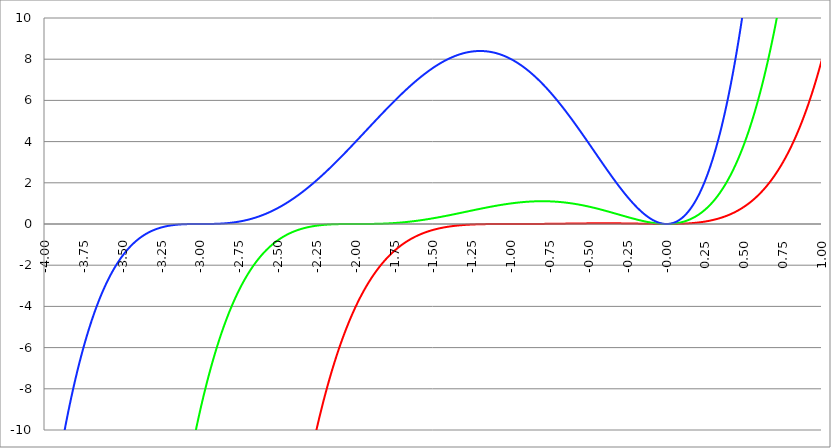
| Category | Series 1 | Series 0 | Series 2 |
|---|---|---|---|
| -4.0 | -432 | -128 | -16 |
| -3.9975 | -430.382 | -127.361 | -15.86 |
| -3.995 | -428.77 | -126.725 | -15.722 |
| -3.9925 | -427.162 | -126.091 | -15.584 |
| -3.99 | -425.559 | -125.46 | -15.447 |
| -3.9875 | -423.96 | -124.831 | -15.311 |
| -3.985 | -422.367 | -124.205 | -15.176 |
| -3.9825 | -420.778 | -123.581 | -15.042 |
| -3.98 | -419.194 | -122.959 | -14.909 |
| -3.9775 | -417.615 | -122.34 | -14.776 |
| -3.975000000000001 | -416.04 | -121.724 | -14.645 |
| -3.972500000000001 | -414.47 | -121.11 | -14.514 |
| -3.970000000000001 | -412.905 | -120.498 | -14.385 |
| -3.967500000000001 | -411.345 | -119.889 | -14.256 |
| -3.965000000000001 | -409.789 | -119.282 | -14.128 |
| -3.962500000000001 | -408.238 | -118.677 | -14 |
| -3.960000000000001 | -406.692 | -118.075 | -13.874 |
| -3.957500000000001 | -405.15 | -117.475 | -13.749 |
| -3.955000000000001 | -403.613 | -116.878 | -13.624 |
| -3.952500000000001 | -402.081 | -116.283 | -13.5 |
| -3.950000000000001 | -400.553 | -115.691 | -13.377 |
| -3.947500000000001 | -399.03 | -115.1 | -13.255 |
| -3.945000000000001 | -397.512 | -114.512 | -13.134 |
| -3.942500000000001 | -395.998 | -113.927 | -13.013 |
| -3.940000000000001 | -394.489 | -113.344 | -12.894 |
| -3.937500000000001 | -392.984 | -112.763 | -12.775 |
| -3.935000000000001 | -391.484 | -112.184 | -12.657 |
| -3.932500000000001 | -389.988 | -111.608 | -12.54 |
| -3.930000000000001 | -388.497 | -111.034 | -12.423 |
| -3.927500000000002 | -387.011 | -110.463 | -12.308 |
| -3.925000000000002 | -385.529 | -109.893 | -12.193 |
| -3.922500000000002 | -384.051 | -109.326 | -12.079 |
| -3.920000000000002 | -382.579 | -108.762 | -11.966 |
| -3.917500000000002 | -381.11 | -108.199 | -11.853 |
| -3.915000000000002 | -379.646 | -107.639 | -11.742 |
| -3.912500000000002 | -378.187 | -107.081 | -11.631 |
| -3.910000000000002 | -376.732 | -106.526 | -11.521 |
| -3.907500000000002 | -375.281 | -105.972 | -11.411 |
| -3.905000000000002 | -373.835 | -105.421 | -11.303 |
| -3.902500000000002 | -372.394 | -104.872 | -11.195 |
| -3.900000000000002 | -370.957 | -104.325 | -11.088 |
| -3.897500000000002 | -369.524 | -103.781 | -10.982 |
| -3.895000000000002 | -368.096 | -103.239 | -10.876 |
| -3.892500000000002 | -366.672 | -102.699 | -10.772 |
| -3.890000000000002 | -365.252 | -102.161 | -10.668 |
| -3.887500000000002 | -363.837 | -101.625 | -10.564 |
| -3.885000000000002 | -362.426 | -101.092 | -10.462 |
| -3.882500000000002 | -361.02 | -100.561 | -10.36 |
| -3.880000000000002 | -359.618 | -100.032 | -10.259 |
| -3.877500000000003 | -358.22 | -99.505 | -10.159 |
| -3.875000000000003 | -356.826 | -98.98 | -10.059 |
| -3.872500000000003 | -355.437 | -98.457 | -9.96 |
| -3.870000000000003 | -354.052 | -97.937 | -9.862 |
| -3.867500000000003 | -352.672 | -97.419 | -9.765 |
| -3.865000000000003 | -351.296 | -96.903 | -9.668 |
| -3.862500000000003 | -349.924 | -96.389 | -9.572 |
| -3.860000000000003 | -348.556 | -95.877 | -9.477 |
| -3.857500000000003 | -347.193 | -95.367 | -9.382 |
| -3.855000000000003 | -345.834 | -94.859 | -9.289 |
| -3.852500000000003 | -344.479 | -94.354 | -9.195 |
| -3.850000000000003 | -343.128 | -93.851 | -9.103 |
| -3.847500000000003 | -341.781 | -93.349 | -9.011 |
| -3.845000000000003 | -340.439 | -92.85 | -8.92 |
| -3.842500000000003 | -339.101 | -92.353 | -8.83 |
| -3.840000000000003 | -337.767 | -91.858 | -8.74 |
| -3.837500000000003 | -336.437 | -91.365 | -8.651 |
| -3.835000000000003 | -335.112 | -90.874 | -8.562 |
| -3.832500000000004 | -333.791 | -90.385 | -8.475 |
| -3.830000000000004 | -332.473 | -89.898 | -8.387 |
| -3.827500000000004 | -331.16 | -89.413 | -8.301 |
| -3.825000000000004 | -329.851 | -88.931 | -8.215 |
| -3.822500000000004 | -328.546 | -88.45 | -8.13 |
| -3.820000000000004 | -327.246 | -87.971 | -8.046 |
| -3.817500000000004 | -325.949 | -87.495 | -7.962 |
| -3.815000000000004 | -324.657 | -87.02 | -7.879 |
| -3.812500000000004 | -323.368 | -86.547 | -7.796 |
| -3.810000000000004 | -322.084 | -86.077 | -7.714 |
| -3.807500000000004 | -320.804 | -85.608 | -7.633 |
| -3.805000000000004 | -319.527 | -85.141 | -7.553 |
| -3.802500000000004 | -318.255 | -84.677 | -7.473 |
| -3.800000000000004 | -316.987 | -84.214 | -7.393 |
| -3.797500000000004 | -315.723 | -83.753 | -7.315 |
| -3.795000000000004 | -314.463 | -83.295 | -7.236 |
| -3.792500000000004 | -313.206 | -82.838 | -7.159 |
| -3.790000000000004 | -311.954 | -82.383 | -7.082 |
| -3.787500000000004 | -310.706 | -81.93 | -7.006 |
| -3.785000000000004 | -309.462 | -81.479 | -6.93 |
| -3.782500000000005 | -308.222 | -81.03 | -6.855 |
| -3.780000000000005 | -306.986 | -80.583 | -6.781 |
| -3.777500000000005 | -305.753 | -80.138 | -6.707 |
| -3.775000000000005 | -304.525 | -79.695 | -6.633 |
| -3.772500000000005 | -303.301 | -79.253 | -6.561 |
| -3.770000000000005 | -302.08 | -78.814 | -6.489 |
| -3.767500000000005 | -300.863 | -78.376 | -6.417 |
| -3.765000000000005 | -299.651 | -77.941 | -6.346 |
| -3.762500000000005 | -298.442 | -77.507 | -6.276 |
| -3.760000000000005 | -297.237 | -77.075 | -6.206 |
| -3.757500000000005 | -296.036 | -76.645 | -6.137 |
| -3.755000000000005 | -294.839 | -76.217 | -6.068 |
| -3.752500000000005 | -293.646 | -75.791 | -6 |
| -3.750000000000005 | -292.456 | -75.366 | -5.933 |
| -3.747500000000005 | -291.27 | -74.944 | -5.866 |
| -3.745000000000005 | -290.089 | -74.523 | -5.799 |
| -3.742500000000005 | -288.911 | -74.104 | -5.733 |
| -3.740000000000005 | -287.736 | -73.687 | -5.668 |
| -3.737500000000006 | -286.566 | -73.272 | -5.603 |
| -3.735000000000006 | -285.399 | -72.858 | -5.539 |
| -3.732500000000006 | -284.237 | -72.447 | -5.475 |
| -3.730000000000006 | -283.078 | -72.037 | -5.412 |
| -3.727500000000006 | -281.922 | -71.629 | -5.35 |
| -3.725000000000006 | -280.771 | -71.223 | -5.288 |
| -3.722500000000006 | -279.623 | -70.819 | -5.226 |
| -3.720000000000006 | -278.479 | -70.416 | -5.165 |
| -3.717500000000006 | -277.339 | -70.015 | -5.105 |
| -3.715000000000006 | -276.202 | -69.616 | -5.045 |
| -3.712500000000006 | -275.069 | -69.219 | -4.985 |
| -3.710000000000006 | -273.94 | -68.823 | -4.926 |
| -3.707500000000006 | -272.815 | -68.43 | -4.868 |
| -3.705000000000006 | -271.693 | -68.038 | -4.81 |
| -3.702500000000006 | -270.575 | -67.647 | -4.753 |
| -3.700000000000006 | -269.46 | -67.259 | -4.696 |
| -3.697500000000006 | -268.349 | -66.872 | -4.639 |
| -3.695000000000006 | -267.242 | -66.487 | -4.583 |
| -3.692500000000006 | -266.139 | -66.104 | -4.528 |
| -3.690000000000006 | -265.039 | -65.722 | -4.473 |
| -3.687500000000006 | -263.943 | -65.342 | -4.419 |
| -3.685000000000007 | -262.85 | -64.964 | -4.365 |
| -3.682500000000007 | -261.761 | -64.588 | -4.311 |
| -3.680000000000007 | -260.675 | -64.213 | -4.258 |
| -3.677500000000007 | -259.593 | -63.84 | -4.206 |
| -3.675000000000007 | -258.515 | -63.469 | -4.154 |
| -3.672500000000007 | -257.44 | -63.099 | -4.102 |
| -3.670000000000007 | -256.369 | -62.731 | -4.051 |
| -3.667500000000007 | -255.302 | -62.365 | -4 |
| -3.665000000000007 | -254.237 | -62 | -3.95 |
| -3.662500000000007 | -253.177 | -61.637 | -3.9 |
| -3.660000000000007 | -252.12 | -61.275 | -3.851 |
| -3.657500000000007 | -251.066 | -60.916 | -3.802 |
| -3.655000000000007 | -250.016 | -60.558 | -3.754 |
| -3.652500000000007 | -248.97 | -60.201 | -3.706 |
| -3.650000000000007 | -247.927 | -59.846 | -3.659 |
| -3.647500000000007 | -246.887 | -59.493 | -3.612 |
| -3.645000000000007 | -245.851 | -59.142 | -3.565 |
| -3.642500000000008 | -244.818 | -58.792 | -3.519 |
| -3.640000000000008 | -243.789 | -58.443 | -3.473 |
| -3.637500000000008 | -242.764 | -58.096 | -3.428 |
| -3.635000000000008 | -241.741 | -57.751 | -3.383 |
| -3.632500000000008 | -240.722 | -57.408 | -3.339 |
| -3.630000000000008 | -239.707 | -57.066 | -3.295 |
| -3.627500000000008 | -238.695 | -56.725 | -3.251 |
| -3.625000000000008 | -237.686 | -56.387 | -3.208 |
| -3.622500000000008 | -236.681 | -56.049 | -3.165 |
| -3.620000000000008 | -235.679 | -55.714 | -3.123 |
| -3.617500000000008 | -234.681 | -55.38 | -3.081 |
| -3.615000000000008 | -233.685 | -55.047 | -3.04 |
| -3.612500000000008 | -232.694 | -54.716 | -2.999 |
| -3.610000000000008 | -231.705 | -54.387 | -2.958 |
| -3.607500000000008 | -230.72 | -54.059 | -2.918 |
| -3.605000000000008 | -229.738 | -53.732 | -2.878 |
| -3.602500000000008 | -228.76 | -53.407 | -2.838 |
| -3.600000000000008 | -227.785 | -53.084 | -2.799 |
| -3.597500000000009 | -226.813 | -52.762 | -2.761 |
| -3.595000000000009 | -225.845 | -52.442 | -2.722 |
| -3.592500000000009 | -224.879 | -52.123 | -2.684 |
| -3.590000000000009 | -223.918 | -51.806 | -2.647 |
| -3.587500000000009 | -222.959 | -51.49 | -2.61 |
| -3.585000000000009 | -222.004 | -51.176 | -2.573 |
| -3.582500000000009 | -221.051 | -50.863 | -2.537 |
| -3.580000000000009 | -220.103 | -50.552 | -2.501 |
| -3.577500000000009 | -219.157 | -50.242 | -2.465 |
| -3.575000000000009 | -218.215 | -49.934 | -2.43 |
| -3.572500000000009 | -217.275 | -49.627 | -2.395 |
| -3.570000000000009 | -216.339 | -49.321 | -2.36 |
| -3.56750000000001 | -215.407 | -49.017 | -2.326 |
| -3.565000000000009 | -214.477 | -48.715 | -2.292 |
| -3.562500000000009 | -213.551 | -48.414 | -2.259 |
| -3.560000000000009 | -212.628 | -48.114 | -2.226 |
| -3.557500000000009 | -211.708 | -47.816 | -2.193 |
| -3.555000000000009 | -210.791 | -47.519 | -2.161 |
| -3.55250000000001 | -209.877 | -47.224 | -2.128 |
| -3.55000000000001 | -208.967 | -46.93 | -2.097 |
| -3.54750000000001 | -208.059 | -46.638 | -2.065 |
| -3.54500000000001 | -207.155 | -46.347 | -2.034 |
| -3.54250000000001 | -206.254 | -46.057 | -2.004 |
| -3.54000000000001 | -205.356 | -45.769 | -1.973 |
| -3.53750000000001 | -204.461 | -45.482 | -1.943 |
| -3.53500000000001 | -203.57 | -45.196 | -1.914 |
| -3.53250000000001 | -202.681 | -44.912 | -1.884 |
| -3.53000000000001 | -201.795 | -44.63 | -1.855 |
| -3.52750000000001 | -200.913 | -44.348 | -1.826 |
| -3.52500000000001 | -200.033 | -44.068 | -1.798 |
| -3.52250000000001 | -199.157 | -43.79 | -1.77 |
| -3.52000000000001 | -198.284 | -43.513 | -1.742 |
| -3.51750000000001 | -197.413 | -43.237 | -1.715 |
| -3.51500000000001 | -196.546 | -42.962 | -1.688 |
| -3.51250000000001 | -195.682 | -42.689 | -1.661 |
| -3.51000000000001 | -194.821 | -42.418 | -1.634 |
| -3.50750000000001 | -193.963 | -42.147 | -1.608 |
| -3.505000000000011 | -193.108 | -41.878 | -1.582 |
| -3.502500000000011 | -192.255 | -41.61 | -1.557 |
| -3.500000000000011 | -191.406 | -41.344 | -1.531 |
| -3.497500000000011 | -190.56 | -41.079 | -1.506 |
| -3.495000000000011 | -189.717 | -40.815 | -1.482 |
| -3.492500000000011 | -188.877 | -40.552 | -1.457 |
| -3.490000000000011 | -188.039 | -40.291 | -1.433 |
| -3.487500000000011 | -187.205 | -40.031 | -1.409 |
| -3.485000000000011 | -186.374 | -39.773 | -1.386 |
| -3.482500000000011 | -185.545 | -39.515 | -1.362 |
| -3.480000000000011 | -184.72 | -39.259 | -1.339 |
| -3.477500000000011 | -183.897 | -39.005 | -1.317 |
| -3.475000000000011 | -183.078 | -38.751 | -1.294 |
| -3.472500000000011 | -182.261 | -38.499 | -1.272 |
| -3.470000000000011 | -181.447 | -38.248 | -1.25 |
| -3.467500000000011 | -180.636 | -37.999 | -1.229 |
| -3.465000000000011 | -179.828 | -37.75 | -1.207 |
| -3.462500000000011 | -179.023 | -37.503 | -1.186 |
| -3.460000000000011 | -178.22 | -37.257 | -1.165 |
| -3.457500000000012 | -177.421 | -37.013 | -1.145 |
| -3.455000000000012 | -176.624 | -36.769 | -1.124 |
| -3.452500000000012 | -175.831 | -36.527 | -1.104 |
| -3.450000000000012 | -175.04 | -36.286 | -1.085 |
| -3.447500000000012 | -174.252 | -36.047 | -1.065 |
| -3.445000000000012 | -173.466 | -35.808 | -1.046 |
| -3.442500000000012 | -172.684 | -35.571 | -1.027 |
| -3.440000000000012 | -171.904 | -35.335 | -1.008 |
| -3.437500000000012 | -171.127 | -35.1 | -0.99 |
| -3.435000000000012 | -170.353 | -34.867 | -0.971 |
| -3.432500000000012 | -169.582 | -34.634 | -0.953 |
| -3.430000000000012 | -168.813 | -34.403 | -0.935 |
| -3.427500000000012 | -168.048 | -34.173 | -0.918 |
| -3.425000000000012 | -167.285 | -33.944 | -0.901 |
| -3.422500000000012 | -166.525 | -33.717 | -0.883 |
| -3.420000000000012 | -165.767 | -33.49 | -0.867 |
| -3.417500000000012 | -165.012 | -33.265 | -0.85 |
| -3.415000000000012 | -164.26 | -33.041 | -0.834 |
| -3.412500000000012 | -163.511 | -32.818 | -0.817 |
| -3.410000000000013 | -162.765 | -32.596 | -0.801 |
| -3.407500000000012 | -162.021 | -32.376 | -0.786 |
| -3.405000000000013 | -161.28 | -32.156 | -0.77 |
| -3.402500000000013 | -160.541 | -31.938 | -0.755 |
| -3.400000000000013 | -159.805 | -31.721 | -0.74 |
| -3.397500000000013 | -159.072 | -31.505 | -0.725 |
| -3.395000000000013 | -158.342 | -31.29 | -0.71 |
| -3.392500000000013 | -157.614 | -31.076 | -0.696 |
| -3.390000000000013 | -156.889 | -30.863 | -0.682 |
| -3.387500000000013 | -156.167 | -30.652 | -0.668 |
| -3.385000000000013 | -155.447 | -30.442 | -0.654 |
| -3.382500000000013 | -154.73 | -30.232 | -0.64 |
| -3.380000000000013 | -154.015 | -30.024 | -0.627 |
| -3.377500000000013 | -153.304 | -29.817 | -0.614 |
| -3.375000000000013 | -152.594 | -29.611 | -0.601 |
| -3.372500000000013 | -151.888 | -29.406 | -0.588 |
| -3.370000000000013 | -151.184 | -29.203 | -0.575 |
| -3.367500000000013 | -150.482 | -29 | -0.563 |
| -3.365000000000013 | -149.783 | -28.798 | -0.551 |
| -3.362500000000014 | -149.087 | -28.598 | -0.539 |
| -3.360000000000014 | -148.393 | -28.398 | -0.527 |
| -3.357500000000014 | -147.702 | -28.2 | -0.515 |
| -3.355000000000014 | -147.014 | -28.003 | -0.504 |
| -3.352500000000014 | -146.328 | -27.807 | -0.492 |
| -3.350000000000014 | -145.644 | -27.612 | -0.481 |
| -3.347500000000014 | -144.963 | -27.417 | -0.47 |
| -3.345000000000014 | -144.285 | -27.224 | -0.459 |
| -3.342500000000014 | -143.609 | -27.032 | -0.449 |
| -3.340000000000014 | -142.936 | -26.842 | -0.438 |
| -3.337500000000014 | -142.265 | -26.652 | -0.428 |
| -3.335000000000014 | -141.596 | -26.463 | -0.418 |
| -3.332500000000014 | -140.931 | -26.275 | -0.408 |
| -3.330000000000014 | -140.267 | -26.088 | -0.399 |
| -3.327500000000014 | -139.606 | -25.902 | -0.389 |
| -3.325000000000014 | -138.948 | -25.718 | -0.38 |
| -3.322500000000014 | -138.292 | -25.534 | -0.37 |
| -3.320000000000014 | -137.639 | -25.351 | -0.361 |
| -3.317500000000015 | -136.988 | -25.169 | -0.352 |
| -3.315000000000015 | -136.339 | -24.989 | -0.343 |
| -3.312500000000015 | -135.693 | -24.809 | -0.335 |
| -3.310000000000015 | -135.049 | -24.63 | -0.326 |
| -3.307500000000015 | -134.408 | -24.453 | -0.318 |
| -3.305000000000015 | -133.769 | -24.276 | -0.31 |
| -3.302500000000015 | -133.133 | -24.1 | -0.302 |
| -3.300000000000015 | -132.499 | -23.925 | -0.294 |
| -3.297500000000015 | -131.867 | -23.752 | -0.286 |
| -3.295000000000015 | -131.238 | -23.579 | -0.279 |
| -3.292500000000015 | -130.611 | -23.407 | -0.271 |
| -3.290000000000015 | -129.986 | -23.236 | -0.264 |
| -3.287500000000015 | -129.364 | -23.066 | -0.257 |
| -3.285000000000015 | -128.745 | -22.897 | -0.25 |
| -3.282500000000015 | -128.127 | -22.729 | -0.243 |
| -3.280000000000015 | -127.512 | -22.562 | -0.236 |
| -3.277500000000015 | -126.9 | -22.396 | -0.23 |
| -3.275000000000015 | -126.289 | -22.231 | -0.223 |
| -3.272500000000015 | -125.681 | -22.066 | -0.217 |
| -3.270000000000016 | -125.076 | -21.903 | -0.21 |
| -3.267500000000015 | -124.472 | -21.741 | -0.204 |
| -3.265000000000016 | -123.871 | -21.579 | -0.198 |
| -3.262500000000016 | -123.273 | -21.419 | -0.193 |
| -3.260000000000016 | -122.676 | -21.259 | -0.187 |
| -3.257500000000016 | -122.082 | -21.101 | -0.181 |
| -3.255000000000016 | -121.49 | -20.943 | -0.176 |
| -3.252500000000016 | -120.901 | -20.786 | -0.17 |
| -3.250000000000016 | -120.313 | -20.63 | -0.165 |
| -3.247500000000016 | -119.728 | -20.475 | -0.16 |
| -3.245000000000016 | -119.146 | -20.321 | -0.155 |
| -3.242500000000016 | -118.565 | -20.167 | -0.15 |
| -3.240000000000016 | -117.987 | -20.015 | -0.145 |
| -3.237500000000016 | -117.411 | -19.863 | -0.14 |
| -3.235000000000016 | -116.837 | -19.713 | -0.136 |
| -3.232500000000016 | -116.266 | -19.563 | -0.131 |
| -3.230000000000016 | -115.696 | -19.414 | -0.127 |
| -3.227500000000016 | -115.129 | -19.266 | -0.123 |
| -3.225000000000016 | -114.564 | -19.119 | -0.118 |
| -3.222500000000016 | -114.002 | -18.973 | -0.114 |
| -3.220000000000016 | -113.441 | -18.827 | -0.11 |
| -3.217500000000016 | -112.883 | -18.683 | -0.107 |
| -3.215000000000017 | -112.327 | -18.539 | -0.103 |
| -3.212500000000017 | -111.773 | -18.396 | -0.099 |
| -3.210000000000017 | -111.221 | -18.254 | -0.095 |
| -3.207500000000016 | -110.671 | -18.113 | -0.092 |
| -3.205000000000017 | -110.124 | -17.973 | -0.088 |
| -3.202500000000017 | -109.579 | -17.833 | -0.085 |
| -3.200000000000017 | -109.036 | -17.695 | -0.082 |
| -3.197500000000017 | -108.495 | -17.557 | -0.079 |
| -3.195000000000017 | -107.956 | -17.42 | -0.076 |
| -3.192500000000017 | -107.419 | -17.284 | -0.073 |
| -3.190000000000017 | -106.884 | -17.148 | -0.07 |
| -3.187500000000017 | -106.352 | -17.014 | -0.067 |
| -3.185000000000017 | -105.821 | -16.88 | -0.064 |
| -3.182500000000017 | -105.293 | -16.747 | -0.062 |
| -3.180000000000017 | -104.767 | -16.615 | -0.059 |
| -3.177500000000017 | -104.243 | -16.484 | -0.056 |
| -3.175000000000018 | -103.721 | -16.353 | -0.054 |
| -3.172500000000018 | -103.201 | -16.223 | -0.052 |
| -3.170000000000018 | -102.683 | -16.094 | -0.049 |
| -3.167500000000017 | -102.167 | -15.966 | -0.047 |
| -3.165000000000018 | -101.653 | -15.839 | -0.045 |
| -3.162500000000018 | -101.142 | -15.712 | -0.043 |
| -3.160000000000018 | -100.632 | -15.586 | -0.041 |
| -3.157500000000018 | -100.124 | -15.461 | -0.039 |
| -3.155000000000018 | -99.619 | -15.337 | -0.037 |
| -3.152500000000018 | -99.115 | -15.214 | -0.035 |
| -3.150000000000018 | -98.614 | -15.091 | -0.033 |
| -3.147500000000018 | -98.114 | -14.969 | -0.032 |
| -3.145000000000018 | -97.616 | -14.848 | -0.03 |
| -3.142500000000018 | -97.121 | -14.727 | -0.029 |
| -3.140000000000018 | -96.627 | -14.607 | -0.027 |
| -3.137500000000018 | -96.136 | -14.488 | -0.026 |
| -3.135000000000018 | -95.646 | -14.37 | -0.024 |
| -3.132500000000018 | -95.159 | -14.253 | -0.023 |
| -3.130000000000019 | -94.673 | -14.136 | -0.022 |
| -3.127500000000018 | -94.19 | -14.02 | -0.02 |
| -3.125000000000019 | -93.708 | -13.905 | -0.019 |
| -3.122500000000019 | -93.228 | -13.79 | -0.018 |
| -3.120000000000019 | -92.751 | -13.676 | -0.017 |
| -3.117500000000019 | -92.275 | -13.563 | -0.016 |
| -3.115000000000019 | -91.801 | -13.451 | -0.015 |
| -3.112500000000019 | -91.329 | -13.339 | -0.014 |
| -3.110000000000019 | -90.859 | -13.228 | -0.013 |
| -3.10750000000002 | -90.391 | -13.118 | -0.012 |
| -3.10500000000002 | -89.925 | -13.008 | -0.011 |
| -3.10250000000002 | -89.461 | -12.899 | -0.01 |
| -3.10000000000002 | -88.998 | -12.791 | -0.01 |
| -3.09750000000002 | -88.538 | -12.683 | -0.009 |
| -3.095000000000019 | -88.079 | -12.577 | -0.008 |
| -3.092500000000019 | -87.623 | -12.47 | -0.008 |
| -3.090000000000019 | -87.168 | -12.365 | -0.007 |
| -3.08750000000002 | -86.715 | -12.26 | -0.006 |
| -3.085000000000019 | -86.264 | -12.156 | -0.006 |
| -3.08250000000002 | -85.815 | -12.053 | -0.005 |
| -3.08000000000002 | -85.367 | -11.95 | -0.005 |
| -3.07750000000002 | -84.922 | -11.848 | -0.004 |
| -3.07500000000002 | -84.478 | -11.747 | -0.004 |
| -3.07250000000002 | -84.036 | -11.646 | -0.004 |
| -3.07000000000002 | -83.596 | -11.546 | -0.003 |
| -3.06750000000002 | -83.158 | -11.447 | -0.003 |
| -3.06500000000002 | -82.722 | -11.348 | -0.003 |
| -3.06250000000002 | -82.288 | -11.25 | -0.002 |
| -3.06000000000002 | -81.855 | -11.152 | -0.002 |
| -3.05750000000002 | -81.424 | -11.055 | -0.002 |
| -3.05500000000002 | -80.995 | -10.959 | -0.002 |
| -3.05250000000002 | -80.568 | -10.864 | -0.001 |
| -3.05000000000002 | -80.142 | -10.769 | -0.001 |
| -3.04750000000002 | -79.719 | -10.675 | -0.001 |
| -3.04500000000002 | -79.297 | -10.581 | -0.001 |
| -3.04250000000002 | -78.876 | -10.488 | -0.001 |
| -3.04000000000002 | -78.458 | -10.396 | -0.001 |
| -3.037500000000021 | -78.041 | -10.304 | 0 |
| -3.035000000000021 | -77.627 | -10.213 | 0 |
| -3.032500000000021 | -77.214 | -10.122 | 0 |
| -3.030000000000021 | -76.802 | -10.032 | 0 |
| -3.027500000000021 | -76.393 | -9.943 | 0 |
| -3.025000000000021 | -75.985 | -9.854 | 0 |
| -3.022500000000021 | -75.578 | -9.766 | 0 |
| -3.020000000000021 | -75.174 | -9.679 | 0 |
| -3.017500000000021 | -74.771 | -9.592 | 0 |
| -3.015000000000021 | -74.37 | -9.505 | 0 |
| -3.012500000000021 | -73.971 | -9.42 | 0 |
| -3.010000000000021 | -73.573 | -9.335 | 0 |
| -3.007500000000021 | -73.178 | -9.25 | 0 |
| -3.005000000000021 | -72.783 | -9.166 | 0 |
| -3.002500000000021 | -72.391 | -9.083 | 0 |
| -3.000000000000021 | -72 | -9 | 0 |
| -2.997500000000021 | -71.611 | -8.918 | 0 |
| -2.995000000000021 | -71.223 | -8.836 | 0 |
| -2.992500000000021 | -70.838 | -8.755 | 0 |
| -2.990000000000021 | -70.453 | -8.675 | 0 |
| -2.987500000000022 | -70.071 | -8.595 | 0 |
| -2.985000000000022 | -69.69 | -8.515 | 0 |
| -2.982500000000022 | -69.311 | -8.436 | 0 |
| -2.980000000000022 | -68.933 | -8.358 | 0 |
| -2.977500000000022 | -68.557 | -8.28 | 0 |
| -2.975000000000022 | -68.183 | -8.203 | 0 |
| -2.972500000000022 | -67.81 | -8.127 | 0 |
| -2.970000000000022 | -67.439 | -8.051 | 0 |
| -2.967500000000022 | -67.07 | -7.975 | 0 |
| -2.965000000000022 | -66.702 | -7.9 | 0 |
| -2.962500000000022 | -66.335 | -7.826 | 0 |
| -2.960000000000022 | -65.971 | -7.752 | 0.001 |
| -2.957500000000022 | -65.608 | -7.678 | 0.001 |
| -2.955000000000022 | -65.246 | -7.605 | 0.001 |
| -2.952500000000022 | -64.886 | -7.533 | 0.001 |
| -2.950000000000022 | -64.528 | -7.461 | 0.001 |
| -2.947500000000022 | -64.171 | -7.39 | 0.001 |
| -2.945000000000022 | -63.816 | -7.319 | 0.001 |
| -2.942500000000023 | -63.462 | -7.249 | 0.002 |
| -2.940000000000023 | -63.11 | -7.179 | 0.002 |
| -2.937500000000023 | -62.76 | -7.11 | 0.002 |
| -2.935000000000023 | -62.411 | -7.041 | 0.002 |
| -2.932500000000023 | -62.063 | -6.973 | 0.003 |
| -2.930000000000023 | -61.717 | -6.905 | 0.003 |
| -2.927500000000023 | -61.373 | -6.838 | 0.003 |
| -2.925000000000023 | -61.03 | -6.771 | 0.004 |
| -2.922500000000023 | -60.689 | -6.705 | 0.004 |
| -2.920000000000023 | -60.349 | -6.639 | 0.004 |
| -2.917500000000023 | -60.011 | -6.574 | 0.005 |
| -2.915000000000023 | -59.674 | -6.509 | 0.005 |
| -2.912500000000023 | -59.338 | -6.445 | 0.006 |
| -2.910000000000023 | -59.005 | -6.381 | 0.006 |
| -2.907500000000023 | -58.672 | -6.318 | 0.007 |
| -2.905000000000023 | -58.341 | -6.255 | 0.007 |
| -2.902500000000023 | -58.012 | -6.193 | 0.008 |
| -2.900000000000023 | -57.684 | -6.131 | 0.008 |
| -2.897500000000023 | -57.358 | -6.069 | 0.009 |
| -2.895000000000023 | -57.033 | -6.009 | 0.01 |
| -2.892500000000024 | -56.709 | -5.948 | 0.01 |
| -2.890000000000024 | -56.387 | -5.888 | 0.011 |
| -2.887500000000024 | -56.067 | -5.828 | 0.012 |
| -2.885000000000024 | -55.748 | -5.769 | 0.013 |
| -2.882500000000024 | -55.43 | -5.711 | 0.013 |
| -2.880000000000024 | -55.114 | -5.652 | 0.014 |
| -2.877500000000024 | -54.799 | -5.595 | 0.015 |
| -2.875000000000024 | -54.485 | -5.537 | 0.016 |
| -2.872500000000024 | -54.173 | -5.48 | 0.017 |
| -2.870000000000024 | -53.863 | -5.424 | 0.018 |
| -2.867500000000024 | -53.554 | -5.368 | 0.019 |
| -2.865000000000024 | -53.246 | -5.312 | 0.02 |
| -2.862500000000024 | -52.939 | -5.257 | 0.021 |
| -2.860000000000024 | -52.635 | -5.203 | 0.022 |
| -2.857500000000024 | -52.331 | -5.148 | 0.024 |
| -2.855000000000024 | -52.029 | -5.095 | 0.025 |
| -2.852500000000024 | -51.728 | -5.041 | 0.026 |
| -2.850000000000024 | -51.429 | -4.988 | 0.027 |
| -2.847500000000025 | -51.131 | -4.936 | 0.029 |
| -2.845000000000025 | -50.834 | -4.884 | 0.03 |
| -2.842500000000025 | -50.539 | -4.832 | 0.032 |
| -2.840000000000025 | -50.245 | -4.781 | 0.033 |
| -2.837500000000025 | -49.952 | -4.73 | 0.035 |
| -2.835000000000025 | -49.661 | -4.679 | 0.036 |
| -2.832500000000025 | -49.371 | -4.629 | 0.038 |
| -2.830000000000025 | -49.082 | -4.579 | 0.039 |
| -2.827500000000025 | -48.795 | -4.53 | 0.041 |
| -2.825000000000025 | -48.509 | -4.481 | 0.043 |
| -2.822500000000025 | -48.225 | -4.433 | 0.045 |
| -2.820000000000025 | -47.942 | -4.385 | 0.046 |
| -2.817500000000025 | -47.66 | -4.337 | 0.048 |
| -2.815000000000025 | -47.379 | -4.29 | 0.05 |
| -2.812500000000025 | -47.1 | -4.243 | 0.052 |
| -2.810000000000025 | -46.822 | -4.196 | 0.054 |
| -2.807500000000025 | -46.545 | -4.15 | 0.056 |
| -2.805000000000025 | -46.27 | -4.104 | 0.058 |
| -2.802500000000025 | -45.996 | -4.059 | 0.061 |
| -2.800000000000026 | -45.723 | -4.014 | 0.063 |
| -2.797500000000026 | -45.451 | -3.969 | 0.065 |
| -2.795000000000026 | -45.181 | -3.925 | 0.067 |
| -2.792500000000026 | -44.912 | -3.881 | 0.07 |
| -2.790000000000026 | -44.644 | -3.838 | 0.072 |
| -2.787500000000026 | -44.378 | -3.795 | 0.075 |
| -2.785000000000026 | -44.113 | -3.752 | 0.077 |
| -2.782500000000026 | -43.849 | -3.71 | 0.08 |
| -2.780000000000026 | -43.586 | -3.668 | 0.082 |
| -2.777500000000026 | -43.325 | -3.626 | 0.085 |
| -2.775000000000026 | -43.065 | -3.585 | 0.088 |
| -2.772500000000026 | -42.806 | -3.544 | 0.091 |
| -2.770000000000026 | -42.548 | -3.503 | 0.093 |
| -2.767500000000026 | -42.292 | -3.463 | 0.096 |
| -2.765000000000026 | -42.036 | -3.423 | 0.099 |
| -2.762500000000026 | -41.782 | -3.383 | 0.102 |
| -2.760000000000026 | -41.529 | -3.344 | 0.105 |
| -2.757500000000026 | -41.278 | -3.305 | 0.108 |
| -2.755000000000026 | -41.027 | -3.267 | 0.112 |
| -2.752500000000027 | -40.778 | -3.228 | 0.115 |
| -2.750000000000027 | -40.53 | -3.19 | 0.118 |
| -2.747500000000026 | -40.283 | -3.153 | 0.122 |
| -2.745000000000027 | -40.038 | -3.116 | 0.125 |
| -2.742500000000027 | -39.793 | -3.079 | 0.128 |
| -2.740000000000027 | -39.55 | -3.042 | 0.132 |
| -2.737500000000027 | -39.308 | -3.006 | 0.136 |
| -2.735000000000027 | -39.067 | -2.97 | 0.139 |
| -2.732500000000027 | -38.828 | -2.935 | 0.143 |
| -2.730000000000027 | -38.589 | -2.899 | 0.147 |
| -2.727500000000027 | -38.352 | -2.864 | 0.151 |
| -2.725000000000027 | -38.115 | -2.83 | 0.154 |
| -2.722500000000027 | -37.88 | -2.795 | 0.158 |
| -2.720000000000027 | -37.646 | -2.761 | 0.162 |
| -2.717500000000027 | -37.414 | -2.728 | 0.166 |
| -2.715000000000027 | -37.182 | -2.694 | 0.171 |
| -2.712500000000027 | -36.951 | -2.661 | 0.175 |
| -2.710000000000027 | -36.722 | -2.629 | 0.179 |
| -2.707500000000027 | -36.494 | -2.596 | 0.183 |
| -2.705000000000028 | -36.267 | -2.564 | 0.188 |
| -2.702500000000028 | -36.041 | -2.532 | 0.192 |
| -2.700000000000028 | -35.816 | -2.5 | 0.197 |
| -2.697500000000028 | -35.592 | -2.469 | 0.201 |
| -2.695000000000028 | -35.369 | -2.438 | 0.206 |
| -2.692500000000028 | -35.148 | -2.408 | 0.211 |
| -2.690000000000028 | -34.927 | -2.377 | 0.216 |
| -2.687500000000028 | -34.708 | -2.347 | 0.22 |
| -2.685000000000028 | -34.49 | -2.317 | 0.225 |
| -2.682500000000028 | -34.272 | -2.288 | 0.23 |
| -2.680000000000028 | -34.056 | -2.258 | 0.235 |
| -2.677500000000028 | -33.841 | -2.229 | 0.24 |
| -2.675000000000028 | -33.627 | -2.201 | 0.246 |
| -2.672500000000028 | -33.414 | -2.172 | 0.251 |
| -2.670000000000028 | -33.203 | -2.144 | 0.256 |
| -2.667500000000028 | -32.992 | -2.116 | 0.262 |
| -2.665000000000028 | -32.782 | -2.089 | 0.267 |
| -2.662500000000028 | -32.573 | -2.061 | 0.273 |
| -2.660000000000028 | -32.366 | -2.034 | 0.278 |
| -2.657500000000029 | -32.159 | -2.007 | 0.284 |
| -2.655000000000029 | -31.954 | -1.981 | 0.289 |
| -2.652500000000029 | -31.749 | -1.955 | 0.295 |
| -2.650000000000029 | -31.546 | -1.929 | 0.301 |
| -2.647500000000029 | -31.344 | -1.903 | 0.307 |
| -2.645000000000029 | -31.142 | -1.877 | 0.313 |
| -2.642500000000029 | -30.942 | -1.852 | 0.319 |
| -2.640000000000029 | -30.743 | -1.827 | 0.325 |
| -2.637500000000029 | -30.544 | -1.802 | 0.331 |
| -2.635000000000029 | -30.347 | -1.778 | 0.338 |
| -2.632500000000029 | -30.151 | -1.754 | 0.344 |
| -2.630000000000029 | -29.955 | -1.73 | 0.35 |
| -2.62750000000003 | -29.761 | -1.706 | 0.357 |
| -2.625000000000029 | -29.568 | -1.682 | 0.363 |
| -2.622500000000029 | -29.375 | -1.659 | 0.37 |
| -2.620000000000029 | -29.184 | -1.636 | 0.377 |
| -2.617500000000029 | -28.994 | -1.613 | 0.383 |
| -2.615000000000029 | -28.805 | -1.591 | 0.39 |
| -2.612500000000029 | -28.616 | -1.568 | 0.397 |
| -2.61000000000003 | -28.429 | -1.546 | 0.404 |
| -2.60750000000003 | -28.242 | -1.524 | 0.411 |
| -2.60500000000003 | -28.057 | -1.503 | 0.418 |
| -2.60250000000003 | -27.872 | -1.481 | 0.425 |
| -2.60000000000003 | -27.689 | -1.46 | 0.433 |
| -2.59750000000003 | -27.506 | -1.439 | 0.44 |
| -2.59500000000003 | -27.325 | -1.418 | 0.447 |
| -2.59250000000003 | -27.144 | -1.398 | 0.455 |
| -2.59000000000003 | -26.964 | -1.378 | 0.462 |
| -2.58750000000003 | -26.786 | -1.358 | 0.47 |
| -2.58500000000003 | -26.608 | -1.338 | 0.478 |
| -2.58250000000003 | -26.431 | -1.318 | 0.485 |
| -2.58000000000003 | -26.255 | -1.299 | 0.493 |
| -2.57750000000003 | -26.08 | -1.28 | 0.501 |
| -2.57500000000003 | -25.906 | -1.261 | 0.509 |
| -2.57250000000003 | -25.733 | -1.242 | 0.517 |
| -2.57000000000003 | -25.56 | -1.223 | 0.525 |
| -2.56750000000003 | -25.389 | -1.205 | 0.533 |
| -2.565000000000031 | -25.218 | -1.187 | 0.542 |
| -2.562500000000031 | -25.049 | -1.169 | 0.55 |
| -2.560000000000031 | -24.88 | -1.151 | 0.558 |
| -2.557500000000031 | -24.712 | -1.133 | 0.567 |
| -2.555000000000031 | -24.546 | -1.116 | 0.575 |
| -2.552500000000031 | -24.38 | -1.099 | 0.584 |
| -2.550000000000031 | -24.214 | -1.082 | 0.593 |
| -2.547500000000031 | -24.05 | -1.065 | 0.601 |
| -2.545000000000031 | -23.887 | -1.048 | 0.61 |
| -2.542500000000031 | -23.725 | -1.032 | 0.619 |
| -2.540000000000031 | -23.563 | -1.016 | 0.628 |
| -2.537500000000031 | -23.402 | -1 | 0.637 |
| -2.535000000000031 | -23.242 | -0.984 | 0.646 |
| -2.532500000000031 | -23.083 | -0.968 | 0.655 |
| -2.530000000000031 | -22.925 | -0.953 | 0.665 |
| -2.527500000000031 | -22.768 | -0.938 | 0.674 |
| -2.525000000000031 | -22.612 | -0.923 | 0.683 |
| -2.522500000000031 | -22.456 | -0.908 | 0.693 |
| -2.520000000000032 | -22.301 | -0.893 | 0.702 |
| -2.517500000000032 | -22.148 | -0.878 | 0.712 |
| -2.515000000000032 | -21.994 | -0.864 | 0.722 |
| -2.512500000000032 | -21.842 | -0.85 | 0.731 |
| -2.510000000000032 | -21.691 | -0.836 | 0.741 |
| -2.507500000000032 | -21.54 | -0.822 | 0.751 |
| -2.505000000000032 | -21.391 | -0.808 | 0.761 |
| -2.502500000000032 | -21.242 | -0.795 | 0.771 |
| -2.500000000000032 | -21.094 | -0.781 | 0.781 |
| -2.497500000000032 | -20.947 | -0.768 | 0.791 |
| -2.495000000000032 | -20.8 | -0.755 | 0.802 |
| -2.492500000000032 | -20.654 | -0.742 | 0.812 |
| -2.490000000000032 | -20.51 | -0.729 | 0.822 |
| -2.487500000000032 | -20.366 | -0.717 | 0.833 |
| -2.485000000000032 | -20.222 | -0.704 | 0.843 |
| -2.482500000000032 | -20.08 | -0.692 | 0.854 |
| -2.480000000000032 | -19.938 | -0.68 | 0.865 |
| -2.477500000000032 | -19.797 | -0.668 | 0.876 |
| -2.475000000000032 | -19.657 | -0.656 | 0.886 |
| -2.472500000000033 | -19.518 | -0.645 | 0.897 |
| -2.470000000000033 | -19.38 | -0.633 | 0.908 |
| -2.467500000000032 | -19.242 | -0.622 | 0.919 |
| -2.465000000000033 | -19.105 | -0.611 | 0.93 |
| -2.462500000000033 | -18.969 | -0.6 | 0.942 |
| -2.460000000000033 | -18.833 | -0.589 | 0.953 |
| -2.457500000000033 | -18.699 | -0.578 | 0.964 |
| -2.455000000000033 | -18.565 | -0.568 | 0.976 |
| -2.452500000000033 | -18.432 | -0.557 | 0.987 |
| -2.450000000000033 | -18.299 | -0.547 | 0.999 |
| -2.447500000000033 | -18.168 | -0.537 | 1.01 |
| -2.445000000000033 | -18.037 | -0.527 | 1.022 |
| -2.442500000000033 | -17.907 | -0.517 | 1.034 |
| -2.440000000000033 | -17.777 | -0.507 | 1.046 |
| -2.437500000000033 | -17.649 | -0.498 | 1.057 |
| -2.435000000000033 | -17.521 | -0.488 | 1.069 |
| -2.432500000000033 | -17.394 | -0.479 | 1.081 |
| -2.430000000000033 | -17.267 | -0.469 | 1.094 |
| -2.427500000000033 | -17.141 | -0.46 | 1.106 |
| -2.425000000000034 | -17.016 | -0.451 | 1.118 |
| -2.422500000000034 | -16.892 | -0.443 | 1.13 |
| -2.420000000000034 | -16.769 | -0.434 | 1.143 |
| -2.417500000000034 | -16.646 | -0.425 | 1.155 |
| -2.415000000000034 | -16.524 | -0.417 | 1.168 |
| -2.412500000000034 | -16.402 | -0.409 | 1.18 |
| -2.410000000000034 | -16.281 | -0.4 | 1.193 |
| -2.407500000000034 | -16.161 | -0.392 | 1.206 |
| -2.405000000000034 | -16.042 | -0.384 | 1.218 |
| -2.402500000000034 | -15.923 | -0.376 | 1.231 |
| -2.400000000000034 | -15.805 | -0.369 | 1.244 |
| -2.397500000000034 | -15.688 | -0.361 | 1.257 |
| -2.395000000000034 | -15.572 | -0.354 | 1.27 |
| -2.392500000000034 | -15.456 | -0.346 | 1.283 |
| -2.390000000000034 | -15.341 | -0.339 | 1.297 |
| -2.387500000000034 | -15.226 | -0.332 | 1.31 |
| -2.385000000000034 | -15.112 | -0.325 | 1.323 |
| -2.382500000000034 | -14.999 | -0.318 | 1.337 |
| -2.380000000000034 | -14.886 | -0.311 | 1.35 |
| -2.377500000000035 | -14.775 | -0.304 | 1.364 |
| -2.375000000000035 | -14.663 | -0.297 | 1.377 |
| -2.372500000000035 | -14.553 | -0.291 | 1.391 |
| -2.370000000000035 | -14.443 | -0.285 | 1.404 |
| -2.367500000000035 | -14.334 | -0.278 | 1.418 |
| -2.365000000000035 | -14.225 | -0.272 | 1.432 |
| -2.362500000000035 | -14.117 | -0.266 | 1.446 |
| -2.360000000000035 | -14.01 | -0.26 | 1.46 |
| -2.357500000000035 | -13.903 | -0.254 | 1.474 |
| -2.355000000000035 | -13.797 | -0.248 | 1.488 |
| -2.352500000000035 | -13.692 | -0.242 | 1.502 |
| -2.350000000000035 | -13.587 | -0.237 | 1.517 |
| -2.347500000000035 | -13.483 | -0.231 | 1.531 |
| -2.345000000000035 | -13.38 | -0.226 | 1.545 |
| -2.342500000000035 | -13.277 | -0.22 | 1.56 |
| -2.340000000000035 | -13.175 | -0.215 | 1.574 |
| -2.337500000000035 | -13.073 | -0.21 | 1.589 |
| -2.335000000000035 | -12.972 | -0.205 | 1.603 |
| -2.332500000000035 | -12.872 | -0.2 | 1.618 |
| -2.330000000000036 | -12.772 | -0.195 | 1.633 |
| -2.327500000000036 | -12.673 | -0.19 | 1.648 |
| -2.325000000000036 | -12.575 | -0.186 | 1.662 |
| -2.322500000000036 | -12.477 | -0.181 | 1.677 |
| -2.320000000000036 | -12.379 | -0.176 | 1.692 |
| -2.317500000000036 | -12.283 | -0.172 | 1.707 |
| -2.315000000000036 | -12.187 | -0.168 | 1.723 |
| -2.312500000000036 | -12.091 | -0.163 | 1.738 |
| -2.310000000000036 | -11.996 | -0.159 | 1.753 |
| -2.307500000000036 | -11.902 | -0.155 | 1.768 |
| -2.305000000000036 | -11.808 | -0.151 | 1.784 |
| -2.302500000000036 | -11.715 | -0.147 | 1.799 |
| -2.300000000000036 | -11.622 | -0.143 | 1.814 |
| -2.297500000000036 | -11.53 | -0.139 | 1.83 |
| -2.295000000000036 | -11.439 | -0.135 | 1.846 |
| -2.292500000000036 | -11.348 | -0.132 | 1.861 |
| -2.290000000000036 | -11.257 | -0.128 | 1.877 |
| -2.287500000000036 | -11.168 | -0.124 | 1.893 |
| -2.285000000000036 | -11.079 | -0.121 | 1.908 |
| -2.282500000000036 | -10.99 | -0.117 | 1.924 |
| -2.280000000000036 | -10.902 | -0.114 | 1.94 |
| -2.277500000000036 | -10.814 | -0.111 | 1.956 |
| -2.275000000000037 | -10.727 | -0.108 | 1.972 |
| -2.272500000000037 | -10.641 | -0.104 | 1.988 |
| -2.270000000000037 | -10.555 | -0.101 | 2.005 |
| -2.267500000000036 | -10.47 | -0.098 | 2.021 |
| -2.265000000000037 | -10.385 | -0.095 | 2.037 |
| -2.262500000000037 | -10.301 | -0.093 | 2.053 |
| -2.260000000000037 | -10.217 | -0.09 | 2.07 |
| -2.257500000000037 | -10.134 | -0.087 | 2.086 |
| -2.255000000000037 | -10.051 | -0.084 | 2.103 |
| -2.252500000000037 | -9.969 | -0.082 | 2.119 |
| -2.250000000000037 | -9.888 | -0.079 | 2.136 |
| -2.247500000000037 | -9.807 | -0.077 | 2.152 |
| -2.245000000000037 | -9.726 | -0.074 | 2.169 |
| -2.242500000000037 | -9.646 | -0.072 | 2.186 |
| -2.240000000000037 | -9.567 | -0.069 | 2.203 |
| -2.237500000000037 | -9.488 | -0.067 | 2.219 |
| -2.235000000000038 | -9.409 | -0.065 | 2.236 |
| -2.232500000000038 | -9.331 | -0.063 | 2.253 |
| -2.230000000000038 | -9.254 | -0.061 | 2.27 |
| -2.227500000000037 | -9.177 | -0.058 | 2.287 |
| -2.225000000000038 | -9.101 | -0.056 | 2.304 |
| -2.222500000000038 | -9.025 | -0.054 | 2.322 |
| -2.220000000000038 | -8.949 | -0.052 | 2.339 |
| -2.217500000000038 | -8.874 | -0.051 | 2.356 |
| -2.215000000000038 | -8.8 | -0.049 | 2.373 |
| -2.212500000000038 | -8.726 | -0.047 | 2.391 |
| -2.210000000000038 | -8.652 | -0.045 | 2.408 |
| -2.207500000000038 | -8.58 | -0.044 | 2.425 |
| -2.205000000000038 | -8.507 | -0.042 | 2.443 |
| -2.202500000000038 | -8.435 | -0.04 | 2.461 |
| -2.200000000000038 | -8.364 | -0.039 | 2.478 |
| -2.197500000000038 | -8.292 | -0.037 | 2.496 |
| -2.195000000000038 | -8.222 | -0.036 | 2.513 |
| -2.192500000000038 | -8.152 | -0.034 | 2.531 |
| -2.190000000000039 | -8.082 | -0.033 | 2.549 |
| -2.187500000000038 | -8.013 | -0.032 | 2.567 |
| -2.185000000000039 | -7.944 | -0.03 | 2.584 |
| -2.182500000000039 | -7.876 | -0.029 | 2.602 |
| -2.180000000000039 | -7.808 | -0.028 | 2.62 |
| -2.177500000000039 | -7.741 | -0.027 | 2.638 |
| -2.175000000000039 | -7.674 | -0.025 | 2.656 |
| -2.172500000000039 | -7.608 | -0.024 | 2.674 |
| -2.170000000000039 | -7.542 | -0.023 | 2.692 |
| -2.16750000000004 | -7.476 | -0.022 | 2.711 |
| -2.16500000000004 | -7.411 | -0.021 | 2.729 |
| -2.16250000000004 | -7.347 | -0.02 | 2.747 |
| -2.16000000000004 | -7.283 | -0.019 | 2.765 |
| -2.15750000000004 | -7.219 | -0.018 | 2.784 |
| -2.155000000000039 | -7.156 | -0.017 | 2.802 |
| -2.152500000000039 | -7.093 | -0.016 | 2.82 |
| -2.150000000000039 | -7.03 | -0.016 | 2.839 |
| -2.14750000000004 | -6.968 | -0.015 | 2.857 |
| -2.14500000000004 | -6.907 | -0.014 | 2.876 |
| -2.14250000000004 | -6.846 | -0.013 | 2.894 |
| -2.14000000000004 | -6.785 | -0.013 | 2.913 |
| -2.13750000000004 | -6.725 | -0.012 | 2.931 |
| -2.13500000000004 | -6.665 | -0.011 | 2.95 |
| -2.13250000000004 | -6.605 | -0.011 | 2.969 |
| -2.13000000000004 | -6.546 | -0.01 | 2.988 |
| -2.12750000000004 | -6.488 | -0.009 | 3.006 |
| -2.12500000000004 | -6.429 | -0.009 | 3.025 |
| -2.12250000000004 | -6.372 | -0.008 | 3.044 |
| -2.12000000000004 | -6.314 | -0.008 | 3.063 |
| -2.11750000000004 | -6.257 | -0.007 | 3.082 |
| -2.11500000000004 | -6.201 | -0.007 | 3.101 |
| -2.11250000000004 | -6.145 | -0.006 | 3.12 |
| -2.11000000000004 | -6.089 | -0.006 | 3.139 |
| -2.10750000000004 | -6.033 | -0.006 | 3.158 |
| -2.10500000000004 | -5.978 | -0.005 | 3.177 |
| -2.10250000000004 | -5.924 | -0.005 | 3.196 |
| -2.10000000000004 | -5.87 | -0.004 | 3.215 |
| -2.097500000000041 | -5.816 | -0.004 | 3.234 |
| -2.095000000000041 | -5.762 | -0.004 | 3.253 |
| -2.092500000000041 | -5.709 | -0.003 | 3.272 |
| -2.090000000000041 | -5.657 | -0.003 | 3.292 |
| -2.087500000000041 | -5.605 | -0.003 | 3.311 |
| -2.085000000000041 | -5.553 | -0.003 | 3.33 |
| -2.082500000000041 | -5.501 | -0.002 | 3.35 |
| -2.080000000000041 | -5.45 | -0.002 | 3.369 |
| -2.077500000000041 | -5.399 | -0.002 | 3.388 |
| -2.075000000000041 | -5.349 | -0.002 | 3.408 |
| -2.072500000000041 | -5.299 | -0.002 | 3.427 |
| -2.070000000000041 | -5.249 | -0.001 | 3.447 |
| -2.067500000000041 | -5.2 | -0.001 | 3.466 |
| -2.065000000000041 | -5.151 | -0.001 | 3.486 |
| -2.062500000000041 | -5.102 | -0.001 | 3.505 |
| -2.060000000000041 | -5.054 | -0.001 | 3.525 |
| -2.057500000000041 | -5.006 | -0.001 | 3.544 |
| -2.055000000000041 | -4.959 | -0.001 | 3.564 |
| -2.052500000000042 | -4.912 | -0.001 | 3.583 |
| -2.050000000000042 | -4.865 | -0.001 | 3.603 |
| -2.047500000000042 | -4.818 | 0 | 3.623 |
| -2.045000000000042 | -4.772 | 0 | 3.642 |
| -2.042500000000042 | -4.727 | 0 | 3.662 |
| -2.040000000000042 | -4.681 | 0 | 3.682 |
| -2.037500000000042 | -4.636 | 0 | 3.702 |
| -2.035000000000042 | -4.591 | 0 | 3.721 |
| -2.032500000000042 | -4.547 | 0 | 3.741 |
| -2.030000000000042 | -4.503 | 0 | 3.761 |
| -2.027500000000042 | -4.459 | 0 | 3.781 |
| -2.025000000000042 | -4.416 | 0 | 3.801 |
| -2.022500000000042 | -4.373 | 0 | 3.821 |
| -2.020000000000042 | -4.33 | 0 | 3.84 |
| -2.017500000000042 | -4.288 | 0 | 3.86 |
| -2.015000000000042 | -4.246 | 0 | 3.88 |
| -2.012500000000042 | -4.204 | 0 | 3.9 |
| -2.010000000000042 | -4.163 | 0 | 3.92 |
| -2.007500000000042 | -4.121 | 0 | 3.94 |
| -2.005000000000043 | -4.081 | 0 | 3.96 |
| -2.002500000000043 | -4.04 | 0 | 3.98 |
| -2.000000000000043 | -4 | 0 | 4 |
| -1.997500000000043 | -3.96 | 0 | 4.02 |
| -1.995000000000043 | -3.921 | 0 | 4.04 |
| -1.992500000000043 | -3.881 | 0 | 4.06 |
| -1.990000000000043 | -3.842 | 0 | 4.08 |
| -1.987500000000043 | -3.804 | 0 | 4.1 |
| -1.985000000000043 | -3.766 | 0 | 4.12 |
| -1.982500000000043 | -3.728 | 0 | 4.14 |
| -1.980000000000043 | -3.69 | 0 | 4.16 |
| -1.977500000000043 | -3.652 | 0 | 4.18 |
| -1.975000000000043 | -3.615 | 0 | 4.201 |
| -1.972500000000043 | -3.579 | 0 | 4.221 |
| -1.970000000000043 | -3.542 | 0 | 4.241 |
| -1.967500000000043 | -3.506 | 0 | 4.261 |
| -1.965000000000043 | -3.47 | 0 | 4.281 |
| -1.962500000000043 | -3.434 | 0 | 4.301 |
| -1.960000000000043 | -3.399 | 0 | 4.321 |
| -1.957500000000044 | -3.364 | 0 | 4.341 |
| -1.955000000000044 | -3.329 | 0 | 4.362 |
| -1.952500000000044 | -3.294 | 0 | 4.382 |
| -1.950000000000044 | -3.26 | 0 | 4.402 |
| -1.947500000000044 | -3.226 | 0.001 | 4.422 |
| -1.945000000000044 | -3.193 | 0.001 | 4.442 |
| -1.942500000000044 | -3.159 | 0.001 | 4.462 |
| -1.940000000000044 | -3.126 | 0.001 | 4.483 |
| -1.937500000000044 | -3.093 | 0.001 | 4.503 |
| -1.935000000000044 | -3.061 | 0.001 | 4.523 |
| -1.932500000000044 | -3.028 | 0.001 | 4.543 |
| -1.930000000000044 | -2.996 | 0.001 | 4.563 |
| -1.927500000000044 | -2.964 | 0.001 | 4.583 |
| -1.925000000000044 | -2.933 | 0.002 | 4.603 |
| -1.922500000000044 | -2.902 | 0.002 | 4.624 |
| -1.920000000000044 | -2.871 | 0.002 | 4.644 |
| -1.917500000000044 | -2.84 | 0.002 | 4.664 |
| -1.915000000000044 | -2.809 | 0.002 | 4.684 |
| -1.912500000000044 | -2.779 | 0.002 | 4.704 |
| -1.910000000000045 | -2.749 | 0.003 | 4.724 |
| -1.907500000000045 | -2.719 | 0.003 | 4.745 |
| -1.905000000000045 | -2.69 | 0.003 | 4.765 |
| -1.902500000000045 | -2.661 | 0.003 | 4.785 |
| -1.900000000000045 | -2.632 | 0.004 | 4.805 |
| -1.897500000000045 | -2.603 | 0.004 | 4.825 |
| -1.895000000000045 | -2.574 | 0.004 | 4.845 |
| -1.892500000000045 | -2.546 | 0.004 | 4.865 |
| -1.890000000000045 | -2.518 | 0.005 | 4.885 |
| -1.887500000000045 | -2.49 | 0.005 | 4.905 |
| -1.885000000000045 | -2.463 | 0.005 | 4.925 |
| -1.882500000000045 | -2.436 | 0.006 | 4.946 |
| -1.880000000000045 | -2.409 | 0.006 | 4.966 |
| -1.877500000000045 | -2.382 | 0.006 | 4.986 |
| -1.875000000000045 | -2.355 | 0.007 | 5.006 |
| -1.872500000000045 | -2.329 | 0.007 | 5.026 |
| -1.870000000000045 | -2.303 | 0.008 | 5.046 |
| -1.867500000000045 | -2.277 | 0.008 | 5.066 |
| -1.865000000000045 | -2.251 | 0.009 | 5.086 |
| -1.862500000000046 | -2.226 | 0.009 | 5.106 |
| -1.860000000000046 | -2.2 | 0.009 | 5.126 |
| -1.857500000000046 | -2.176 | 0.01 | 5.145 |
| -1.855000000000046 | -2.151 | 0.01 | 5.165 |
| -1.852500000000046 | -2.126 | 0.011 | 5.185 |
| -1.850000000000046 | -2.102 | 0.012 | 5.205 |
| -1.847500000000046 | -2.078 | 0.012 | 5.225 |
| -1.845000000000046 | -2.054 | 0.013 | 5.245 |
| -1.842500000000046 | -2.03 | 0.013 | 5.265 |
| -1.840000000000046 | -2.007 | 0.014 | 5.285 |
| -1.837500000000046 | -1.983 | 0.014 | 5.304 |
| -1.835000000000046 | -1.96 | 0.015 | 5.324 |
| -1.832500000000046 | -1.937 | 0.016 | 5.344 |
| -1.830000000000046 | -1.915 | 0.016 | 5.364 |
| -1.827500000000046 | -1.892 | 0.017 | 5.383 |
| -1.825000000000046 | -1.87 | 0.018 | 5.403 |
| -1.822500000000046 | -1.848 | 0.019 | 5.423 |
| -1.820000000000046 | -1.826 | 0.019 | 5.442 |
| -1.817500000000046 | -1.805 | 0.02 | 5.462 |
| -1.815000000000047 | -1.783 | 0.021 | 5.482 |
| -1.812500000000047 | -1.762 | 0.022 | 5.501 |
| -1.810000000000047 | -1.741 | 0.022 | 5.521 |
| -1.807500000000047 | -1.72 | 0.023 | 5.54 |
| -1.805000000000047 | -1.7 | 0.024 | 5.56 |
| -1.802500000000047 | -1.679 | 0.025 | 5.579 |
| -1.800000000000047 | -1.659 | 0.026 | 5.599 |
| -1.797500000000047 | -1.639 | 0.027 | 5.618 |
| -1.795000000000047 | -1.619 | 0.028 | 5.638 |
| -1.792500000000047 | -1.599 | 0.029 | 5.657 |
| -1.790000000000047 | -1.58 | 0.03 | 5.676 |
| -1.787500000000047 | -1.56 | 0.031 | 5.696 |
| -1.785000000000047 | -1.541 | 0.032 | 5.715 |
| -1.782500000000047 | -1.522 | 0.033 | 5.734 |
| -1.780000000000047 | -1.504 | 0.034 | 5.753 |
| -1.777500000000047 | -1.485 | 0.035 | 5.773 |
| -1.775000000000047 | -1.467 | 0.036 | 5.792 |
| -1.772500000000047 | -1.448 | 0.037 | 5.811 |
| -1.770000000000047 | -1.43 | 0.038 | 5.83 |
| -1.767500000000048 | -1.412 | 0.039 | 5.849 |
| -1.765000000000048 | -1.395 | 0.04 | 5.868 |
| -1.762500000000048 | -1.377 | 0.042 | 5.887 |
| -1.760000000000048 | -1.36 | 0.043 | 5.906 |
| -1.757500000000048 | -1.343 | 0.044 | 5.925 |
| -1.755000000000048 | -1.326 | 0.045 | 5.944 |
| -1.752500000000048 | -1.309 | 0.047 | 5.963 |
| -1.750000000000048 | -1.292 | 0.048 | 5.981 |
| -1.747500000000048 | -1.275 | 0.049 | 6 |
| -1.745000000000048 | -1.259 | 0.05 | 6.019 |
| -1.742500000000048 | -1.243 | 0.052 | 6.038 |
| -1.740000000000048 | -1.227 | 0.053 | 6.056 |
| -1.737500000000048 | -1.211 | 0.055 | 6.075 |
| -1.735000000000048 | -1.195 | 0.056 | 6.094 |
| -1.732500000000048 | -1.18 | 0.057 | 6.112 |
| -1.730000000000048 | -1.164 | 0.059 | 6.131 |
| -1.727500000000048 | -1.149 | 0.06 | 6.149 |
| -1.725000000000048 | -1.134 | 0.062 | 6.167 |
| -1.722500000000048 | -1.119 | 0.063 | 6.186 |
| -1.720000000000049 | -1.104 | 0.065 | 6.204 |
| -1.717500000000049 | -1.09 | 0.067 | 6.223 |
| -1.715000000000049 | -1.075 | 0.068 | 6.241 |
| -1.712500000000049 | -1.061 | 0.07 | 6.259 |
| -1.710000000000049 | -1.047 | 0.071 | 6.277 |
| -1.707500000000049 | -1.033 | 0.073 | 6.295 |
| -1.705000000000049 | -1.019 | 0.075 | 6.313 |
| -1.702500000000049 | -1.005 | 0.076 | 6.331 |
| -1.700000000000049 | -0.991 | 0.078 | 6.349 |
| -1.697500000000049 | -0.978 | 0.08 | 6.367 |
| -1.69500000000005 | -0.964 | 0.082 | 6.385 |
| -1.69250000000005 | -0.951 | 0.083 | 6.403 |
| -1.69000000000005 | -0.938 | 0.085 | 6.421 |
| -1.687500000000049 | -0.925 | 0.087 | 6.439 |
| -1.685000000000049 | -0.913 | 0.089 | 6.456 |
| -1.682500000000049 | -0.9 | 0.091 | 6.474 |
| -1.680000000000049 | -0.887 | 0.092 | 6.491 |
| -1.677500000000049 | -0.875 | 0.094 | 6.509 |
| -1.675000000000049 | -0.863 | 0.096 | 6.526 |
| -1.67250000000005 | -0.851 | 0.098 | 6.544 |
| -1.67000000000005 | -0.839 | 0.1 | 6.561 |
| -1.66750000000005 | -0.827 | 0.102 | 6.579 |
| -1.66500000000005 | -0.815 | 0.104 | 6.596 |
| -1.66250000000005 | -0.804 | 0.106 | 6.613 |
| -1.66000000000005 | -0.792 | 0.108 | 6.63 |
| -1.65750000000005 | -0.781 | 0.11 | 6.647 |
| -1.65500000000005 | -0.77 | 0.112 | 6.664 |
| -1.65250000000005 | -0.759 | 0.115 | 6.681 |
| -1.65000000000005 | -0.748 | 0.117 | 6.698 |
| -1.64750000000005 | -0.737 | 0.119 | 6.715 |
| -1.64500000000005 | -0.726 | 0.121 | 6.732 |
| -1.64250000000005 | -0.716 | 0.123 | 6.749 |
| -1.64000000000005 | -0.705 | 0.125 | 6.766 |
| -1.63750000000005 | -0.695 | 0.128 | 6.782 |
| -1.63500000000005 | -0.684 | 0.13 | 6.799 |
| -1.63250000000005 | -0.674 | 0.132 | 6.815 |
| -1.63000000000005 | -0.664 | 0.135 | 6.832 |
| -1.62750000000005 | -0.654 | 0.137 | 6.848 |
| -1.625000000000051 | -0.645 | 0.139 | 6.865 |
| -1.622500000000051 | -0.635 | 0.142 | 6.881 |
| -1.620000000000051 | -0.625 | 0.144 | 6.897 |
| -1.617500000000051 | -0.616 | 0.146 | 6.913 |
| -1.615000000000051 | -0.607 | 0.149 | 6.929 |
| -1.612500000000051 | -0.597 | 0.151 | 6.945 |
| -1.610000000000051 | -0.588 | 0.154 | 6.961 |
| -1.607500000000051 | -0.579 | 0.156 | 6.977 |
| -1.605000000000051 | -0.57 | 0.159 | 6.993 |
| -1.602500000000051 | -0.562 | 0.161 | 7.009 |
| -1.600000000000051 | -0.553 | 0.164 | 7.025 |
| -1.597500000000051 | -0.544 | 0.166 | 7.04 |
| -1.595000000000051 | -0.536 | 0.169 | 7.056 |
| -1.592500000000051 | -0.528 | 0.172 | 7.071 |
| -1.590000000000051 | -0.519 | 0.174 | 7.087 |
| -1.587500000000051 | -0.511 | 0.177 | 7.102 |
| -1.585000000000051 | -0.503 | 0.18 | 7.118 |
| -1.582500000000052 | -0.495 | 0.182 | 7.133 |
| -1.580000000000052 | -0.487 | 0.185 | 7.148 |
| -1.577500000000052 | -0.479 | 0.188 | 7.163 |
| -1.575000000000052 | -0.472 | 0.19 | 7.178 |
| -1.572500000000052 | -0.464 | 0.193 | 7.193 |
| -1.570000000000052 | -0.456 | 0.196 | 7.208 |
| -1.567500000000052 | -0.449 | 0.199 | 7.223 |
| -1.565000000000052 | -0.442 | 0.202 | 7.237 |
| -1.562500000000052 | -0.435 | 0.204 | 7.252 |
| -1.560000000000052 | -0.427 | 0.207 | 7.267 |
| -1.557500000000052 | -0.42 | 0.21 | 7.281 |
| -1.555000000000052 | -0.413 | 0.213 | 7.296 |
| -1.552500000000052 | -0.406 | 0.216 | 7.31 |
| -1.550000000000052 | -0.4 | 0.219 | 7.324 |
| -1.547500000000052 | -0.393 | 0.222 | 7.339 |
| -1.545000000000052 | -0.386 | 0.225 | 7.353 |
| -1.542500000000052 | -0.38 | 0.228 | 7.367 |
| -1.540000000000052 | -0.373 | 0.231 | 7.381 |
| -1.537500000000052 | -0.367 | 0.234 | 7.395 |
| -1.535000000000053 | -0.361 | 0.237 | 7.408 |
| -1.532500000000053 | -0.355 | 0.24 | 7.422 |
| -1.530000000000053 | -0.349 | 0.243 | 7.436 |
| -1.527500000000053 | -0.342 | 0.246 | 7.45 |
| -1.525000000000053 | -0.337 | 0.249 | 7.463 |
| -1.522500000000053 | -0.331 | 0.252 | 7.476 |
| -1.520000000000053 | -0.325 | 0.256 | 7.49 |
| -1.517500000000053 | -0.319 | 0.259 | 7.503 |
| -1.515000000000053 | -0.314 | 0.262 | 7.516 |
| -1.512500000000053 | -0.308 | 0.265 | 7.529 |
| -1.510000000000053 | -0.302 | 0.268 | 7.542 |
| -1.507500000000053 | -0.297 | 0.271 | 7.555 |
| -1.505000000000053 | -0.292 | 0.275 | 7.568 |
| -1.502500000000053 | -0.286 | 0.278 | 7.581 |
| -1.500000000000053 | -0.281 | 0.281 | 7.594 |
| -1.497500000000053 | -0.276 | 0.285 | 7.606 |
| -1.495000000000053 | -0.271 | 0.288 | 7.619 |
| -1.492500000000053 | -0.266 | 0.291 | 7.631 |
| -1.490000000000053 | -0.261 | 0.294 | 7.644 |
| -1.487500000000054 | -0.256 | 0.298 | 7.656 |
| -1.485000000000054 | -0.252 | 0.301 | 7.668 |
| -1.482500000000054 | -0.247 | 0.305 | 7.68 |
| -1.480000000000054 | -0.242 | 0.308 | 7.692 |
| -1.477500000000054 | -0.238 | 0.311 | 7.704 |
| -1.475000000000054 | -0.233 | 0.315 | 7.716 |
| -1.472500000000054 | -0.229 | 0.318 | 7.728 |
| -1.470000000000054 | -0.224 | 0.322 | 7.739 |
| -1.467500000000054 | -0.22 | 0.325 | 7.751 |
| -1.465000000000054 | -0.216 | 0.329 | 7.762 |
| -1.462500000000054 | -0.212 | 0.332 | 7.774 |
| -1.460000000000054 | -0.207 | 0.336 | 7.785 |
| -1.457500000000054 | -0.203 | 0.339 | 7.796 |
| -1.455000000000054 | -0.199 | 0.343 | 7.807 |
| -1.452500000000054 | -0.195 | 0.346 | 7.819 |
| -1.450000000000054 | -0.192 | 0.35 | 7.829 |
| -1.447500000000054 | -0.188 | 0.353 | 7.84 |
| -1.445000000000054 | -0.184 | 0.357 | 7.851 |
| -1.442500000000054 | -0.18 | 0.361 | 7.862 |
| -1.440000000000055 | -0.177 | 0.364 | 7.872 |
| -1.437500000000055 | -0.173 | 0.368 | 7.883 |
| -1.435000000000055 | -0.17 | 0.371 | 7.893 |
| -1.432500000000055 | -0.166 | 0.375 | 7.903 |
| -1.430000000000055 | -0.163 | 0.379 | 7.914 |
| -1.427500000000055 | -0.159 | 0.382 | 7.924 |
| -1.425000000000055 | -0.156 | 0.386 | 7.934 |
| -1.422500000000055 | -0.153 | 0.39 | 7.944 |
| -1.420000000000055 | -0.149 | 0.393 | 7.953 |
| -1.417500000000055 | -0.146 | 0.397 | 7.963 |
| -1.415000000000055 | -0.143 | 0.401 | 7.973 |
| -1.412500000000055 | -0.14 | 0.405 | 7.982 |
| -1.410000000000055 | -0.137 | 0.408 | 7.992 |
| -1.407500000000055 | -0.134 | 0.412 | 8.001 |
| -1.405000000000055 | -0.131 | 0.416 | 8.01 |
| -1.402500000000055 | -0.128 | 0.42 | 8.019 |
| -1.400000000000055 | -0.125 | 0.423 | 8.028 |
| -1.397500000000055 | -0.123 | 0.427 | 8.037 |
| -1.395000000000055 | -0.12 | 0.431 | 8.046 |
| -1.392500000000056 | -0.117 | 0.435 | 8.055 |
| -1.390000000000056 | -0.115 | 0.439 | 8.063 |
| -1.387500000000056 | -0.112 | 0.442 | 8.072 |
| -1.385000000000056 | -0.109 | 0.446 | 8.08 |
| -1.382500000000056 | -0.107 | 0.45 | 8.088 |
| -1.380000000000056 | -0.104 | 0.454 | 8.097 |
| -1.377500000000056 | -0.102 | 0.458 | 8.105 |
| -1.375000000000056 | -0.1 | 0.462 | 8.113 |
| -1.372500000000056 | -0.097 | 0.465 | 8.121 |
| -1.370000000000056 | -0.095 | 0.469 | 8.128 |
| -1.367500000000056 | -0.093 | 0.473 | 8.136 |
| -1.365000000000056 | -0.091 | 0.477 | 8.144 |
| -1.362500000000056 | -0.088 | 0.481 | 8.151 |
| -1.360000000000056 | -0.086 | 0.485 | 8.158 |
| -1.357500000000056 | -0.084 | 0.489 | 8.166 |
| -1.355000000000056 | -0.082 | 0.493 | 8.173 |
| -1.352500000000056 | -0.08 | 0.497 | 8.18 |
| -1.350000000000056 | -0.078 | 0.501 | 8.187 |
| -1.347500000000056 | -0.076 | 0.504 | 8.194 |
| -1.345000000000057 | -0.074 | 0.508 | 8.2 |
| -1.342500000000057 | -0.072 | 0.512 | 8.207 |
| -1.340000000000057 | -0.071 | 0.516 | 8.214 |
| -1.337500000000057 | -0.069 | 0.52 | 8.22 |
| -1.335000000000057 | -0.067 | 0.524 | 8.226 |
| -1.332500000000057 | -0.065 | 0.528 | 8.233 |
| -1.330000000000057 | -0.064 | 0.532 | 8.239 |
| -1.327500000000057 | -0.062 | 0.536 | 8.245 |
| -1.325000000000057 | -0.06 | 0.54 | 8.25 |
| -1.322500000000057 | -0.059 | 0.544 | 8.256 |
| -1.320000000000057 | -0.057 | 0.548 | 8.262 |
| -1.317500000000057 | -0.056 | 0.552 | 8.267 |
| -1.315000000000057 | -0.054 | 0.556 | 8.273 |
| -1.312500000000057 | -0.053 | 0.56 | 8.278 |
| -1.310000000000057 | -0.051 | 0.564 | 8.283 |
| -1.307500000000057 | -0.05 | 0.568 | 8.288 |
| -1.305000000000057 | -0.048 | 0.572 | 8.293 |
| -1.302500000000057 | -0.047 | 0.576 | 8.298 |
| -1.300000000000058 | -0.046 | 0.58 | 8.303 |
| -1.297500000000058 | -0.044 | 0.584 | 8.308 |
| -1.295000000000058 | -0.043 | 0.588 | 8.312 |
| -1.292500000000058 | -0.042 | 0.592 | 8.317 |
| -1.290000000000058 | -0.041 | 0.596 | 8.321 |
| -1.287500000000058 | -0.039 | 0.6 | 8.325 |
| -1.285000000000058 | -0.038 | 0.604 | 8.329 |
| -1.282500000000058 | -0.037 | 0.608 | 8.333 |
| -1.280000000000058 | -0.036 | 0.612 | 8.337 |
| -1.277500000000058 | -0.035 | 0.616 | 8.341 |
| -1.275000000000058 | -0.034 | 0.619 | 8.344 |
| -1.272500000000058 | -0.033 | 0.623 | 8.348 |
| -1.270000000000058 | -0.032 | 0.627 | 8.351 |
| -1.267500000000058 | -0.031 | 0.631 | 8.354 |
| -1.265000000000058 | -0.03 | 0.635 | 8.358 |
| -1.262500000000058 | -0.029 | 0.639 | 8.361 |
| -1.260000000000058 | -0.028 | 0.643 | 8.364 |
| -1.257500000000058 | -0.027 | 0.647 | 8.366 |
| -1.255000000000058 | -0.026 | 0.651 | 8.369 |
| -1.252500000000059 | -0.025 | 0.655 | 8.372 |
| -1.250000000000059 | -0.024 | 0.659 | 8.374 |
| -1.247500000000059 | -0.024 | 0.663 | 8.376 |
| -1.245000000000059 | -0.023 | 0.667 | 8.379 |
| -1.242500000000059 | -0.022 | 0.671 | 8.381 |
| -1.240000000000059 | -0.021 | 0.675 | 8.383 |
| -1.237500000000059 | -0.021 | 0.679 | 8.385 |
| -1.235000000000059 | -0.02 | 0.683 | 8.386 |
| -1.232500000000059 | -0.019 | 0.687 | 8.388 |
| -1.23000000000006 | -0.018 | 0.691 | 8.389 |
| -1.227500000000059 | -0.018 | 0.695 | 8.391 |
| -1.225000000000059 | -0.017 | 0.699 | 8.392 |
| -1.222500000000059 | -0.016 | 0.702 | 8.393 |
| -1.220000000000059 | -0.016 | 0.706 | 8.394 |
| -1.217500000000059 | -0.015 | 0.71 | 8.395 |
| -1.215000000000059 | -0.015 | 0.714 | 8.396 |
| -1.212500000000059 | -0.014 | 0.718 | 8.397 |
| -1.210000000000059 | -0.014 | 0.722 | 8.397 |
| -1.20750000000006 | -0.013 | 0.726 | 8.398 |
| -1.20500000000006 | -0.013 | 0.73 | 8.398 |
| -1.20250000000006 | -0.012 | 0.733 | 8.398 |
| -1.20000000000006 | -0.012 | 0.737 | 8.398 |
| -1.19750000000006 | -0.011 | 0.741 | 8.398 |
| -1.19500000000006 | -0.011 | 0.745 | 8.398 |
| -1.19250000000006 | -0.01 | 0.749 | 8.398 |
| -1.19000000000006 | -0.01 | 0.753 | 8.397 |
| -1.18750000000006 | -0.009 | 0.756 | 8.397 |
| -1.18500000000006 | -0.009 | 0.76 | 8.396 |
| -1.18250000000006 | -0.008 | 0.764 | 8.395 |
| -1.18000000000006 | -0.008 | 0.768 | 8.394 |
| -1.17750000000006 | -0.008 | 0.771 | 8.393 |
| -1.17500000000006 | -0.007 | 0.775 | 8.392 |
| -1.17250000000006 | -0.007 | 0.779 | 8.391 |
| -1.17000000000006 | -0.007 | 0.783 | 8.389 |
| -1.16750000000006 | -0.006 | 0.786 | 8.388 |
| -1.16500000000006 | -0.006 | 0.79 | 8.386 |
| -1.16250000000006 | -0.006 | 0.794 | 8.384 |
| -1.160000000000061 | -0.006 | 0.798 | 8.382 |
| -1.157500000000061 | -0.005 | 0.801 | 8.38 |
| -1.155000000000061 | -0.005 | 0.805 | 8.378 |
| -1.152500000000061 | -0.005 | 0.809 | 8.376 |
| -1.150000000000061 | -0.004 | 0.812 | 8.374 |
| -1.147500000000061 | -0.004 | 0.816 | 8.371 |
| -1.145000000000061 | -0.004 | 0.819 | 8.368 |
| -1.142500000000061 | -0.004 | 0.823 | 8.366 |
| -1.140000000000061 | -0.004 | 0.827 | 8.363 |
| -1.137500000000061 | -0.003 | 0.83 | 8.36 |
| -1.135000000000061 | -0.003 | 0.834 | 8.357 |
| -1.132500000000061 | -0.003 | 0.837 | 8.353 |
| -1.130000000000061 | -0.003 | 0.841 | 8.35 |
| -1.127500000000061 | -0.003 | 0.844 | 8.346 |
| -1.125000000000061 | -0.002 | 0.848 | 8.343 |
| -1.122500000000061 | -0.002 | 0.851 | 8.339 |
| -1.120000000000061 | -0.002 | 0.855 | 8.335 |
| -1.117500000000061 | -0.002 | 0.858 | 8.331 |
| -1.115000000000061 | -0.002 | 0.862 | 8.327 |
| -1.112500000000062 | -0.002 | 0.865 | 8.323 |
| -1.110000000000062 | -0.002 | 0.869 | 8.318 |
| -1.107500000000062 | -0.002 | 0.872 | 8.314 |
| -1.105000000000062 | -0.001 | 0.875 | 8.309 |
| -1.102500000000062 | -0.001 | 0.879 | 8.304 |
| -1.100000000000062 | -0.001 | 0.882 | 8.299 |
| -1.097500000000062 | -0.001 | 0.885 | 8.294 |
| -1.095000000000062 | -0.001 | 0.889 | 8.289 |
| -1.092500000000062 | -0.001 | 0.892 | 8.284 |
| -1.090000000000062 | -0.001 | 0.895 | 8.279 |
| -1.087500000000062 | -0.001 | 0.899 | 8.273 |
| -1.085000000000062 | -0.001 | 0.902 | 8.267 |
| -1.082500000000062 | -0.001 | 0.905 | 8.262 |
| -1.080000000000062 | -0.001 | 0.908 | 8.256 |
| -1.077500000000062 | -0.001 | 0.911 | 8.25 |
| -1.075000000000062 | 0 | 0.915 | 8.243 |
| -1.072500000000062 | 0 | 0.918 | 8.237 |
| -1.070000000000062 | 0 | 0.921 | 8.231 |
| -1.067500000000062 | 0 | 0.924 | 8.224 |
| -1.065000000000063 | 0 | 0.927 | 8.218 |
| -1.062500000000063 | 0 | 0.93 | 8.211 |
| -1.060000000000063 | 0 | 0.933 | 8.204 |
| -1.057500000000063 | 0 | 0.936 | 8.197 |
| -1.055000000000063 | 0 | 0.939 | 8.19 |
| -1.052500000000063 | 0 | 0.942 | 8.182 |
| -1.050000000000063 | 0 | 0.945 | 8.175 |
| -1.047500000000063 | 0 | 0.948 | 8.167 |
| -1.045000000000063 | 0 | 0.951 | 8.16 |
| -1.042500000000063 | 0 | 0.954 | 8.152 |
| -1.040000000000063 | 0 | 0.957 | 8.144 |
| -1.037500000000063 | 0 | 0.96 | 8.136 |
| -1.035000000000063 | 0 | 0.963 | 8.128 |
| -1.032500000000063 | 0 | 0.965 | 8.119 |
| -1.030000000000063 | 0 | 0.968 | 8.111 |
| -1.027500000000063 | 0 | 0.971 | 8.102 |
| -1.025000000000063 | 0 | 0.974 | 8.094 |
| -1.022500000000063 | 0 | 0.977 | 8.085 |
| -1.020000000000064 | 0 | 0.979 | 8.076 |
| -1.017500000000064 | 0 | 0.982 | 8.067 |
| -1.015000000000064 | 0 | 0.985 | 8.058 |
| -1.012500000000064 | 0 | 0.987 | 8.048 |
| -1.010000000000064 | 0 | 0.99 | 8.039 |
| -1.007500000000064 | 0 | 0.992 | 8.029 |
| -1.005000000000064 | 0 | 0.995 | 8.02 |
| -1.002500000000064 | 0 | 0.997 | 8.01 |
| -1.000000000000064 | 0 | 1 | 8 |
| -0.997500000000064 | 0 | 1.002 | 7.99 |
| -0.995000000000064 | 0 | 1.005 | 7.98 |
| -0.992500000000064 | 0 | 1.007 | 7.969 |
| -0.990000000000064 | 0 | 1.01 | 7.959 |
| -0.987500000000064 | 0 | 1.012 | 7.948 |
| -0.985000000000064 | 0 | 1.015 | 7.938 |
| -0.982500000000064 | 0 | 1.017 | 7.927 |
| -0.980000000000064 | 0 | 1.019 | 7.916 |
| -0.977500000000064 | 0 | 1.021 | 7.905 |
| -0.975000000000064 | 0 | 1.024 | 7.894 |
| -0.972500000000065 | 0 | 1.026 | 7.882 |
| -0.970000000000065 | 0 | 1.028 | 7.871 |
| -0.967500000000065 | 0 | 1.03 | 7.859 |
| -0.965000000000065 | 0 | 1.032 | 7.848 |
| -0.962500000000065 | 0 | 1.035 | 7.836 |
| -0.960000000000065 | 0 | 1.037 | 7.824 |
| -0.957500000000065 | 0 | 1.039 | 7.812 |
| -0.955000000000065 | 0 | 1.041 | 7.8 |
| -0.952500000000065 | 0 | 1.043 | 7.788 |
| -0.950000000000065 | 0 | 1.045 | 7.775 |
| -0.947500000000065 | 0 | 1.047 | 7.763 |
| -0.945000000000065 | 0 | 1.049 | 7.75 |
| -0.942500000000065 | 0 | 1.051 | 7.737 |
| -0.940000000000065 | 0 | 1.052 | 7.724 |
| -0.937500000000065 | 0 | 1.054 | 7.711 |
| -0.935000000000065 | 0 | 1.056 | 7.698 |
| -0.932500000000065 | 0 | 1.058 | 7.685 |
| -0.930000000000065 | 0 | 1.06 | 7.671 |
| -0.927500000000065 | 0 | 1.061 | 7.658 |
| -0.925000000000066 | 0 | 1.063 | 7.644 |
| -0.922500000000066 | 0 | 1.065 | 7.631 |
| -0.920000000000066 | 0 | 1.066 | 7.617 |
| -0.917500000000066 | 0 | 1.068 | 7.603 |
| -0.915000000000066 | 0.001 | 1.069 | 7.589 |
| -0.912500000000066 | 0.001 | 1.071 | 7.574 |
| -0.910000000000066 | 0.001 | 1.072 | 7.56 |
| -0.907500000000066 | 0.001 | 1.074 | 7.546 |
| -0.905000000000066 | 0.001 | 1.075 | 7.531 |
| -0.902500000000066 | 0.001 | 1.077 | 7.516 |
| -0.900000000000066 | 0.001 | 1.078 | 7.501 |
| -0.897500000000066 | 0.001 | 1.079 | 7.486 |
| -0.895000000000066 | 0.001 | 1.081 | 7.471 |
| -0.892500000000066 | 0.001 | 1.082 | 7.456 |
| -0.890000000000066 | 0.001 | 1.083 | 7.441 |
| -0.887500000000066 | 0.001 | 1.085 | 7.426 |
| -0.885000000000066 | 0.001 | 1.086 | 7.41 |
| -0.882500000000066 | 0.001 | 1.087 | 7.394 |
| -0.880000000000066 | 0.001 | 1.088 | 7.379 |
| -0.877500000000067 | 0.001 | 1.089 | 7.363 |
| -0.875000000000067 | 0.001 | 1.09 | 7.347 |
| -0.872500000000067 | 0.002 | 1.091 | 7.331 |
| -0.870000000000067 | 0.002 | 1.092 | 7.314 |
| -0.867500000000067 | 0.002 | 1.093 | 7.298 |
| -0.865000000000067 | 0.002 | 1.094 | 7.282 |
| -0.862500000000067 | 0.002 | 1.095 | 7.265 |
| -0.860000000000067 | 0.002 | 1.096 | 7.248 |
| -0.857500000000067 | 0.002 | 1.097 | 7.232 |
| -0.855000000000067 | 0.002 | 1.097 | 7.215 |
| -0.852500000000067 | 0.002 | 1.098 | 7.198 |
| -0.850000000000067 | 0.002 | 1.099 | 7.18 |
| -0.847500000000067 | 0.003 | 1.1 | 7.163 |
| -0.845000000000067 | 0.003 | 1.1 | 7.146 |
| -0.842500000000067 | 0.003 | 1.101 | 7.128 |
| -0.840000000000067 | 0.003 | 1.101 | 7.111 |
| -0.837500000000067 | 0.003 | 1.102 | 7.093 |
| -0.835000000000067 | 0.003 | 1.102 | 7.075 |
| -0.832500000000067 | 0.003 | 1.103 | 7.057 |
| -0.830000000000068 | 0.003 | 1.103 | 7.039 |
| -0.827500000000068 | 0.004 | 1.104 | 7.021 |
| -0.825000000000068 | 0.004 | 1.104 | 7.003 |
| -0.822500000000068 | 0.004 | 1.104 | 6.985 |
| -0.820000000000068 | 0.004 | 1.105 | 6.966 |
| -0.817500000000068 | 0.004 | 1.105 | 6.948 |
| -0.815000000000068 | 0.004 | 1.105 | 6.929 |
| -0.812500000000068 | 0.004 | 1.105 | 6.91 |
| -0.810000000000068 | 0.005 | 1.106 | 6.891 |
| -0.807500000000068 | 0.005 | 1.106 | 6.872 |
| -0.805000000000068 | 0.005 | 1.106 | 6.853 |
| -0.802500000000068 | 0.005 | 1.106 | 6.834 |
| -0.800000000000068 | 0.005 | 1.106 | 6.815 |
| -0.797500000000068 | 0.005 | 1.106 | 6.795 |
| -0.795000000000068 | 0.005 | 1.106 | 6.776 |
| -0.792500000000068 | 0.006 | 1.106 | 6.756 |
| -0.790000000000068 | 0.006 | 1.106 | 6.736 |
| -0.787500000000068 | 0.006 | 1.105 | 6.717 |
| -0.785000000000068 | 0.006 | 1.105 | 6.697 |
| -0.782500000000069 | 0.006 | 1.105 | 6.677 |
| -0.780000000000069 | 0.006 | 1.105 | 6.657 |
| -0.777500000000069 | 0.007 | 1.104 | 6.636 |
| -0.775000000000069 | 0.007 | 1.104 | 6.616 |
| -0.772500000000069 | 0.007 | 1.104 | 6.596 |
| -0.770000000000069 | 0.007 | 1.103 | 6.575 |
| -0.767500000000069 | 0.007 | 1.103 | 6.554 |
| -0.765000000000069 | 0.008 | 1.102 | 6.534 |
| -0.762500000000069 | 0.008 | 1.102 | 6.513 |
| -0.760000000000069 | 0.008 | 1.101 | 6.492 |
| -0.757500000000069 | 0.008 | 1.101 | 6.471 |
| -0.755000000000069 | 0.008 | 1.1 | 6.45 |
| -0.752500000000069 | 0.009 | 1.099 | 6.429 |
| -0.750000000000069 | 0.009 | 1.099 | 6.407 |
| -0.747500000000069 | 0.009 | 1.098 | 6.386 |
| -0.745000000000069 | 0.009 | 1.097 | 6.364 |
| -0.742500000000069 | 0.009 | 1.096 | 6.343 |
| -0.740000000000069 | 0.01 | 1.095 | 6.321 |
| -0.737500000000069 | 0.01 | 1.095 | 6.299 |
| -0.73500000000007 | 0.01 | 1.094 | 6.277 |
| -0.73250000000007 | 0.01 | 1.093 | 6.255 |
| -0.73000000000007 | 0.01 | 1.092 | 6.233 |
| -0.72750000000007 | 0.011 | 1.091 | 6.211 |
| -0.72500000000007 | 0.011 | 1.089 | 6.189 |
| -0.72250000000007 | 0.011 | 1.088 | 6.167 |
| -0.72000000000007 | 0.011 | 1.087 | 6.144 |
| -0.71750000000007 | 0.012 | 1.086 | 6.122 |
| -0.71500000000007 | 0.012 | 1.085 | 6.099 |
| -0.71250000000007 | 0.012 | 1.083 | 6.076 |
| -0.71000000000007 | 0.012 | 1.082 | 6.054 |
| -0.70750000000007 | 0.013 | 1.081 | 6.031 |
| -0.70500000000007 | 0.013 | 1.079 | 6.008 |
| -0.70250000000007 | 0.013 | 1.078 | 5.985 |
| -0.70000000000007 | 0.013 | 1.077 | 5.962 |
| -0.69750000000007 | 0.013 | 1.075 | 5.939 |
| -0.69500000000007 | 0.014 | 1.073 | 5.915 |
| -0.69250000000007 | 0.014 | 1.072 | 5.892 |
| -0.69000000000007 | 0.014 | 1.07 | 5.869 |
| -0.687500000000071 | 0.014 | 1.069 | 5.845 |
| -0.685000000000071 | 0.015 | 1.067 | 5.821 |
| -0.682500000000071 | 0.015 | 1.065 | 5.798 |
| -0.680000000000071 | 0.015 | 1.064 | 5.774 |
| -0.677500000000071 | 0.015 | 1.062 | 5.75 |
| -0.675000000000071 | 0.016 | 1.06 | 5.726 |
| -0.672500000000071 | 0.016 | 1.058 | 5.702 |
| -0.670000000000071 | 0.016 | 1.056 | 5.678 |
| -0.667500000000071 | 0.016 | 1.054 | 5.654 |
| -0.665000000000071 | 0.017 | 1.052 | 5.63 |
| -0.662500000000071 | 0.017 | 1.05 | 5.606 |
| -0.660000000000071 | 0.017 | 1.048 | 5.581 |
| -0.657500000000071 | 0.017 | 1.046 | 5.557 |
| -0.655000000000071 | 0.018 | 1.044 | 5.532 |
| -0.652500000000071 | 0.018 | 1.042 | 5.508 |
| -0.650000000000071 | 0.018 | 1.04 | 5.483 |
| -0.647500000000071 | 0.018 | 1.037 | 5.458 |
| -0.645000000000071 | 0.019 | 1.035 | 5.434 |
| -0.642500000000071 | 0.019 | 1.033 | 5.409 |
| -0.640000000000072 | 0.019 | 1.03 | 5.384 |
| -0.637500000000072 | 0.019 | 1.028 | 5.359 |
| -0.635000000000072 | 0.02 | 1.026 | 5.334 |
| -0.632500000000072 | 0.02 | 1.023 | 5.309 |
| -0.630000000000072 | 0.02 | 1.021 | 5.284 |
| -0.627500000000072 | 0.02 | 1.018 | 5.258 |
| -0.625000000000072 | 0.021 | 1.015 | 5.233 |
| -0.622500000000072 | 0.021 | 1.013 | 5.208 |
| -0.620000000000072 | 0.021 | 1.01 | 5.182 |
| -0.617500000000072 | 0.021 | 1.008 | 5.157 |
| -0.615000000000072 | 0.022 | 1.005 | 5.131 |
| -0.612500000000072 | 0.022 | 1.002 | 5.106 |
| -0.610000000000072 | 0.022 | 0.999 | 5.08 |
| -0.607500000000072 | 0.022 | 0.997 | 5.054 |
| -0.605000000000072 | 0.023 | 0.994 | 5.028 |
| -0.602500000000072 | 0.023 | 0.991 | 5.003 |
| -0.600000000000072 | 0.023 | 0.988 | 4.977 |
| -0.597500000000073 | 0.023 | 0.985 | 4.951 |
| -0.595000000000073 | 0.024 | 0.982 | 4.925 |
| -0.592500000000073 | 0.024 | 0.979 | 4.899 |
| -0.590000000000073 | 0.024 | 0.976 | 4.873 |
| -0.587500000000073 | 0.024 | 0.973 | 4.846 |
| -0.585000000000073 | 0.024 | 0.97 | 4.82 |
| -0.582500000000073 | 0.025 | 0.966 | 4.794 |
| -0.580000000000073 | 0.025 | 0.963 | 4.768 |
| -0.577500000000073 | 0.025 | 0.96 | 4.741 |
| -0.575000000000073 | 0.025 | 0.957 | 4.715 |
| -0.572500000000073 | 0.026 | 0.953 | 4.688 |
| -0.570000000000073 | 0.026 | 0.95 | 4.662 |
| -0.567500000000073 | 0.026 | 0.947 | 4.635 |
| -0.565000000000073 | 0.026 | 0.943 | 4.609 |
| -0.562500000000073 | 0.026 | 0.94 | 4.582 |
| -0.560000000000073 | 0.027 | 0.936 | 4.556 |
| -0.557500000000073 | 0.027 | 0.933 | 4.529 |
| -0.555000000000073 | 0.027 | 0.929 | 4.502 |
| -0.552500000000073 | 0.027 | 0.926 | 4.475 |
| -0.550000000000074 | 0.028 | 0.922 | 4.449 |
| -0.547500000000074 | 0.028 | 0.919 | 4.422 |
| -0.545000000000074 | 0.028 | 0.915 | 4.395 |
| -0.542500000000074 | 0.028 | 0.911 | 4.368 |
| -0.540000000000074 | 0.028 | 0.907 | 4.341 |
| -0.537500000000074 | 0.029 | 0.904 | 4.314 |
| -0.535000000000074 | 0.029 | 0.9 | 4.287 |
| -0.532500000000074 | 0.029 | 0.896 | 4.26 |
| -0.530000000000074 | 0.029 | 0.892 | 4.233 |
| -0.527500000000074 | 0.029 | 0.888 | 4.206 |
| -0.525000000000074 | 0.03 | 0.884 | 4.179 |
| -0.522500000000074 | 0.03 | 0.881 | 4.152 |
| -0.520000000000074 | 0.03 | 0.877 | 4.124 |
| -0.517500000000074 | 0.03 | 0.873 | 4.097 |
| -0.515000000000074 | 0.03 | 0.869 | 4.07 |
| -0.512500000000074 | 0.03 | 0.864 | 4.043 |
| -0.510000000000074 | 0.031 | 0.86 | 4.015 |
| -0.507500000000074 | 0.031 | 0.856 | 3.988 |
| -0.505000000000074 | 0.031 | 0.852 | 3.961 |
| -0.502500000000075 | 0.031 | 0.848 | 3.934 |
| -0.500000000000075 | 0.031 | 0.844 | 3.906 |
| -0.497500000000075 | 0.031 | 0.84 | 3.879 |
| -0.495000000000075 | 0.032 | 0.835 | 3.852 |
| -0.492500000000075 | 0.032 | 0.831 | 3.824 |
| -0.490000000000075 | 0.032 | 0.827 | 3.797 |
| -0.487500000000075 | 0.032 | 0.822 | 3.769 |
| -0.485000000000075 | 0.032 | 0.818 | 3.742 |
| -0.482500000000075 | 0.032 | 0.814 | 3.715 |
| -0.480000000000075 | 0.032 | 0.809 | 3.687 |
| -0.477500000000075 | 0.033 | 0.805 | 3.66 |
| -0.475000000000075 | 0.033 | 0.8 | 3.632 |
| -0.472500000000075 | 0.033 | 0.796 | 3.605 |
| -0.470000000000075 | 0.033 | 0.791 | 3.577 |
| -0.467500000000075 | 0.033 | 0.787 | 3.55 |
| -0.465000000000075 | 0.033 | 0.782 | 3.522 |
| -0.462500000000075 | 0.033 | 0.777 | 3.495 |
| -0.460000000000075 | 0.033 | 0.773 | 3.468 |
| -0.457500000000075 | 0.033 | 0.768 | 3.44 |
| -0.455000000000075 | 0.034 | 0.763 | 3.413 |
| -0.452500000000075 | 0.034 | 0.759 | 3.385 |
| -0.450000000000075 | 0.034 | 0.754 | 3.358 |
| -0.447500000000075 | 0.034 | 0.749 | 3.33 |
| -0.445000000000075 | 0.034 | 0.745 | 3.303 |
| -0.442500000000075 | 0.034 | 0.74 | 3.275 |
| -0.440000000000075 | 0.034 | 0.735 | 3.248 |
| -0.437500000000075 | 0.034 | 0.73 | 3.221 |
| -0.435000000000075 | 0.034 | 0.725 | 3.193 |
| -0.432500000000075 | 0.034 | 0.72 | 3.166 |
| -0.430000000000075 | 0.034 | 0.716 | 3.139 |
| -0.427500000000075 | 0.034 | 0.711 | 3.111 |
| -0.425000000000075 | 0.034 | 0.706 | 3.084 |
| -0.422500000000075 | 0.034 | 0.701 | 3.057 |
| -0.420000000000075 | 0.034 | 0.696 | 3.029 |
| -0.417500000000075 | 0.034 | 0.691 | 3.002 |
| -0.415000000000075 | 0.034 | 0.686 | 2.975 |
| -0.412500000000075 | 0.035 | 0.681 | 2.948 |
| -0.410000000000075 | 0.035 | 0.676 | 2.921 |
| -0.407500000000075 | 0.035 | 0.671 | 2.893 |
| -0.405000000000074 | 0.035 | 0.666 | 2.866 |
| -0.402500000000074 | 0.035 | 0.66 | 2.839 |
| -0.400000000000074 | 0.035 | 0.655 | 2.812 |
| -0.397500000000074 | 0.035 | 0.65 | 2.785 |
| -0.395000000000074 | 0.035 | 0.645 | 2.758 |
| -0.392500000000074 | 0.035 | 0.64 | 2.731 |
| -0.390000000000074 | 0.035 | 0.635 | 2.704 |
| -0.387500000000074 | 0.035 | 0.63 | 2.677 |
| -0.385000000000074 | 0.034 | 0.624 | 2.651 |
| -0.382500000000074 | 0.034 | 0.619 | 2.624 |
| -0.380000000000074 | 0.034 | 0.614 | 2.597 |
| -0.377500000000074 | 0.034 | 0.609 | 2.57 |
| -0.375000000000074 | 0.034 | 0.603 | 2.544 |
| -0.372500000000074 | 0.034 | 0.598 | 2.517 |
| -0.370000000000074 | 0.034 | 0.593 | 2.49 |
| -0.367500000000074 | 0.034 | 0.588 | 2.464 |
| -0.365000000000074 | 0.034 | 0.582 | 2.437 |
| -0.362500000000074 | 0.034 | 0.577 | 2.411 |
| -0.360000000000074 | 0.034 | 0.572 | 2.385 |
| -0.357500000000074 | 0.034 | 0.566 | 2.358 |
| -0.355000000000074 | 0.034 | 0.561 | 2.332 |
| -0.352500000000074 | 0.034 | 0.556 | 2.306 |
| -0.350000000000074 | 0.034 | 0.55 | 2.28 |
| -0.347500000000074 | 0.034 | 0.545 | 2.254 |
| -0.345000000000074 | 0.033 | 0.54 | 2.228 |
| -0.342500000000074 | 0.033 | 0.534 | 2.202 |
| -0.340000000000074 | 0.033 | 0.529 | 2.176 |
| -0.337500000000074 | 0.033 | 0.523 | 2.15 |
| -0.335000000000074 | 0.033 | 0.518 | 2.124 |
| -0.332500000000074 | 0.033 | 0.513 | 2.098 |
| -0.330000000000074 | 0.033 | 0.507 | 2.073 |
| -0.327500000000074 | 0.033 | 0.502 | 2.047 |
| -0.325000000000074 | 0.032 | 0.496 | 2.022 |
| -0.322500000000074 | 0.032 | 0.491 | 1.996 |
| -0.320000000000074 | 0.032 | 0.486 | 1.971 |
| -0.317500000000074 | 0.032 | 0.48 | 1.946 |
| -0.315000000000074 | 0.032 | 0.475 | 1.921 |
| -0.312500000000074 | 0.032 | 0.469 | 1.896 |
| -0.310000000000074 | 0.032 | 0.464 | 1.871 |
| -0.307500000000074 | 0.031 | 0.458 | 1.846 |
| -0.305000000000074 | 0.031 | 0.453 | 1.821 |
| -0.302500000000074 | 0.031 | 0.448 | 1.796 |
| -0.300000000000074 | 0.031 | 0.442 | 1.771 |
| -0.297500000000074 | 0.031 | 0.437 | 1.747 |
| -0.295000000000074 | 0.03 | 0.431 | 1.722 |
| -0.292500000000074 | 0.03 | 0.426 | 1.698 |
| -0.290000000000074 | 0.03 | 0.421 | 1.674 |
| -0.287500000000074 | 0.03 | 0.415 | 1.65 |
| -0.285000000000074 | 0.03 | 0.41 | 1.626 |
| -0.282500000000074 | 0.029 | 0.404 | 1.602 |
| -0.280000000000074 | 0.029 | 0.399 | 1.578 |
| -0.277500000000074 | 0.029 | 0.394 | 1.554 |
| -0.275000000000074 | 0.029 | 0.388 | 1.53 |
| -0.272500000000074 | 0.029 | 0.383 | 1.507 |
| -0.270000000000074 | 0.028 | 0.377 | 1.483 |
| -0.267500000000074 | 0.028 | 0.372 | 1.46 |
| -0.265000000000074 | 0.028 | 0.367 | 1.437 |
| -0.262500000000074 | 0.028 | 0.361 | 1.414 |
| -0.260000000000074 | 0.027 | 0.356 | 1.391 |
| -0.257500000000074 | 0.027 | 0.351 | 1.368 |
| -0.255000000000074 | 0.027 | 0.346 | 1.345 |
| -0.252500000000074 | 0.027 | 0.34 | 1.322 |
| -0.250000000000074 | 0.026 | 0.335 | 1.3 |
| -0.247500000000074 | 0.026 | 0.33 | 1.277 |
| -0.245000000000074 | 0.026 | 0.324 | 1.255 |
| -0.242500000000074 | 0.026 | 0.319 | 1.233 |
| -0.240000000000074 | 0.025 | 0.314 | 1.211 |
| -0.237500000000074 | 0.025 | 0.309 | 1.189 |
| -0.235000000000074 | 0.025 | 0.304 | 1.167 |
| -0.232500000000074 | 0.024 | 0.298 | 1.146 |
| -0.230000000000074 | 0.024 | 0.293 | 1.124 |
| -0.227500000000074 | 0.024 | 0.288 | 1.103 |
| -0.225000000000074 | 0.024 | 0.283 | 1.082 |
| -0.222500000000074 | 0.023 | 0.278 | 1.061 |
| -0.220000000000074 | 0.023 | 0.273 | 1.04 |
| -0.217500000000074 | 0.023 | 0.268 | 1.019 |
| -0.215000000000074 | 0.022 | 0.263 | 0.999 |
| -0.212500000000074 | 0.022 | 0.258 | 0.978 |
| -0.210000000000074 | 0.022 | 0.253 | 0.958 |
| -0.207500000000074 | 0.021 | 0.248 | 0.938 |
| -0.205000000000074 | 0.021 | 0.243 | 0.918 |
| -0.202500000000074 | 0.021 | 0.238 | 0.898 |
| -0.200000000000074 | 0.02 | 0.233 | 0.878 |
| -0.197500000000074 | 0.02 | 0.228 | 0.859 |
| -0.195000000000074 | 0.02 | 0.224 | 0.839 |
| -0.192500000000074 | 0.02 | 0.219 | 0.82 |
| -0.190000000000074 | 0.019 | 0.214 | 0.801 |
| -0.187500000000074 | 0.019 | 0.209 | 0.782 |
| -0.185000000000074 | 0.019 | 0.205 | 0.763 |
| -0.182500000000074 | 0.018 | 0.2 | 0.745 |
| -0.180000000000074 | 0.018 | 0.195 | 0.727 |
| -0.177500000000074 | 0.018 | 0.191 | 0.708 |
| -0.175000000000074 | 0.017 | 0.186 | 0.69 |
| -0.172500000000074 | 0.017 | 0.182 | 0.673 |
| -0.170000000000074 | 0.017 | 0.177 | 0.655 |
| -0.167500000000074 | 0.016 | 0.173 | 0.638 |
| -0.165000000000074 | 0.016 | 0.168 | 0.62 |
| -0.162500000000074 | 0.016 | 0.164 | 0.603 |
| -0.160000000000074 | 0.015 | 0.159 | 0.586 |
| -0.157500000000074 | 0.015 | 0.155 | 0.57 |
| -0.155000000000074 | 0.014 | 0.151 | 0.553 |
| -0.152500000000074 | 0.014 | 0.147 | 0.537 |
| -0.150000000000074 | 0.014 | 0.142 | 0.521 |
| -0.147500000000074 | 0.013 | 0.138 | 0.505 |
| -0.145000000000074 | 0.013 | 0.134 | 0.489 |
| -0.142500000000074 | 0.013 | 0.13 | 0.474 |
| -0.140000000000074 | 0.012 | 0.126 | 0.459 |
| -0.137500000000074 | 0.012 | 0.122 | 0.443 |
| -0.135000000000074 | 0.012 | 0.118 | 0.429 |
| -0.132500000000074 | 0.011 | 0.114 | 0.414 |
| -0.130000000000074 | 0.011 | 0.111 | 0.4 |
| -0.127500000000074 | 0.011 | 0.107 | 0.385 |
| -0.125000000000074 | 0.01 | 0.103 | 0.371 |
| -0.122500000000074 | 0.01 | 0.099 | 0.358 |
| -0.120000000000074 | 0.01 | 0.096 | 0.344 |
| -0.117500000000074 | 0.009 | 0.092 | 0.331 |
| -0.115000000000074 | 0.009 | 0.089 | 0.318 |
| -0.112500000000074 | 0.009 | 0.085 | 0.305 |
| -0.110000000000074 | 0.009 | 0.082 | 0.292 |
| -0.107500000000074 | 0.008 | 0.078 | 0.28 |
| -0.105000000000074 | 0.008 | 0.075 | 0.268 |
| -0.102500000000074 | 0.008 | 0.072 | 0.256 |
| -0.100000000000074 | 0.007 | 0.069 | 0.244 |
| -0.0975000000000742 | 0.007 | 0.065 | 0.232 |
| -0.0950000000000742 | 0.007 | 0.062 | 0.221 |
| -0.0925000000000742 | 0.006 | 0.059 | 0.21 |
| -0.0900000000000742 | 0.006 | 0.056 | 0.2 |
| -0.0875000000000742 | 0.006 | 0.054 | 0.189 |
| -0.0850000000000742 | 0.006 | 0.051 | 0.179 |
| -0.0825000000000742 | 0.005 | 0.048 | 0.169 |
| -0.0800000000000742 | 0.005 | 0.045 | 0.159 |
| -0.0775000000000742 | 0.005 | 0.043 | 0.15 |
| -0.0750000000000742 | 0.004 | 0.04 | 0.141 |
| -0.0725000000000742 | 0.004 | 0.038 | 0.132 |
| -0.0700000000000742 | 0.004 | 0.035 | 0.123 |
| -0.0675000000000742 | 0.004 | 0.033 | 0.115 |
| -0.0650000000000742 | 0.003 | 0.031 | 0.107 |
| -0.0625000000000742 | 0.003 | 0.028 | 0.099 |
| -0.0600000000000742 | 0.003 | 0.026 | 0.091 |
| -0.0575000000000742 | 0.003 | 0.024 | 0.084 |
| -0.0550000000000742 | 0.003 | 0.022 | 0.077 |
| -0.0525000000000742 | 0.002 | 0.02 | 0.071 |
| -0.0500000000000742 | 0.002 | 0.019 | 0.064 |
| -0.0475000000000742 | 0.002 | 0.017 | 0.058 |
| -0.0450000000000742 | 0.002 | 0.015 | 0.052 |
| -0.0425000000000742 | 0.002 | 0.014 | 0.047 |
| -0.0400000000000742 | 0.001 | 0.012 | 0.041 |
| -0.0375000000000742 | 0.001 | 0.011 | 0.037 |
| -0.0350000000000742 | 0.001 | 0.009 | 0.032 |
| -0.0325000000000742 | 0.001 | 0.008 | 0.028 |
| -0.0300000000000742 | 0.001 | 0.007 | 0.024 |
| -0.0275000000000742 | 0.001 | 0.006 | 0.02 |
| -0.0250000000000742 | 0.001 | 0.005 | 0.016 |
| -0.0225000000000742 | 0 | 0.004 | 0.013 |
| -0.0200000000000742 | 0 | 0.003 | 0.011 |
| -0.0175000000000742 | 0 | 0.002 | 0.008 |
| -0.0150000000000742 | 0 | 0.002 | 0.006 |
| -0.0125000000000742 | 0 | 0.001 | 0.004 |
| -0.0100000000000742 | 0 | 0.001 | 0.003 |
| -0.0075000000000742 | 0 | 0 | 0.002 |
| -0.0050000000000742 | 0 | 0 | 0.001 |
| -0.0025000000000742 | 0 | 0 | 0 |
| -7.4196725152742e-14 | 0 | 0 | 0 |
| 0.0024999999999258 | 0 | 0 | 0 |
| 0.0049999999999258 | 0 | 0 | 0.001 |
| 0.0074999999999258 | 0 | 0 | 0.002 |
| 0.0099999999999258 | 0 | 0.001 | 0.003 |
| 0.0124999999999258 | 0 | 0.001 | 0.004 |
| 0.0149999999999258 | 0 | 0.002 | 0.006 |
| 0.0174999999999258 | 0 | 0.003 | 0.008 |
| 0.0199999999999258 | 0 | 0.003 | 0.011 |
| 0.0224999999999258 | 0.001 | 0.004 | 0.014 |
| 0.0249999999999258 | 0.001 | 0.005 | 0.017 |
| 0.0274999999999258 | 0.001 | 0.006 | 0.021 |
| 0.0299999999999258 | 0.001 | 0.008 | 0.025 |
| 0.0324999999999258 | 0.001 | 0.009 | 0.029 |
| 0.0349999999999258 | 0.001 | 0.01 | 0.034 |
| 0.0374999999999258 | 0.002 | 0.012 | 0.039 |
| 0.0399999999999258 | 0.002 | 0.014 | 0.045 |
| 0.0424999999999258 | 0.002 | 0.015 | 0.051 |
| 0.0449999999999258 | 0.002 | 0.017 | 0.057 |
| 0.0474999999999258 | 0.003 | 0.019 | 0.064 |
| 0.0499999999999258 | 0.003 | 0.022 | 0.071 |
| 0.0524999999999258 | 0.003 | 0.024 | 0.078 |
| 0.0549999999999258 | 0.004 | 0.026 | 0.086 |
| 0.0574999999999258 | 0.004 | 0.029 | 0.095 |
| 0.0599999999999258 | 0.004 | 0.031 | 0.103 |
| 0.0624999999999258 | 0.005 | 0.034 | 0.112 |
| 0.0649999999999258 | 0.005 | 0.037 | 0.122 |
| 0.0674999999999258 | 0.006 | 0.04 | 0.132 |
| 0.0699999999999258 | 0.006 | 0.043 | 0.142 |
| 0.0724999999999258 | 0.006 | 0.047 | 0.152 |
| 0.0749999999999258 | 0.007 | 0.05 | 0.164 |
| 0.0774999999999258 | 0.008 | 0.054 | 0.175 |
| 0.0799999999999258 | 0.008 | 0.058 | 0.187 |
| 0.0824999999999258 | 0.009 | 0.061 | 0.199 |
| 0.0849999999999258 | 0.009 | 0.065 | 0.212 |
| 0.0874999999999258 | 0.01 | 0.07 | 0.225 |
| 0.0899999999999258 | 0.01 | 0.074 | 0.239 |
| 0.0924999999999258 | 0.011 | 0.078 | 0.253 |
| 0.0949999999999258 | 0.012 | 0.083 | 0.268 |
| 0.0974999999999258 | 0.013 | 0.088 | 0.283 |
| 0.0999999999999258 | 0.013 | 0.093 | 0.298 |
| 0.102499999999926 | 0.014 | 0.098 | 0.314 |
| 0.104999999999926 | 0.015 | 0.103 | 0.33 |
| 0.107499999999926 | 0.016 | 0.108 | 0.347 |
| 0.109999999999926 | 0.017 | 0.114 | 0.364 |
| 0.112499999999926 | 0.017 | 0.119 | 0.382 |
| 0.114999999999926 | 0.018 | 0.125 | 0.4 |
| 0.117499999999926 | 0.019 | 0.131 | 0.418 |
| 0.119999999999926 | 0.02 | 0.137 | 0.437 |
| 0.122499999999926 | 0.021 | 0.143 | 0.457 |
| 0.124999999999926 | 0.022 | 0.15 | 0.477 |
| 0.127499999999926 | 0.023 | 0.157 | 0.497 |
| 0.129999999999926 | 0.024 | 0.163 | 0.518 |
| 0.132499999999926 | 0.026 | 0.17 | 0.54 |
| 0.134999999999926 | 0.027 | 0.177 | 0.562 |
| 0.137499999999926 | 0.028 | 0.185 | 0.584 |
| 0.139999999999926 | 0.029 | 0.192 | 0.607 |
| 0.142499999999926 | 0.03 | 0.2 | 0.63 |
| 0.144999999999926 | 0.032 | 0.207 | 0.654 |
| 0.147499999999926 | 0.033 | 0.215 | 0.678 |
| 0.149999999999926 | 0.034 | 0.224 | 0.703 |
| 0.152499999999926 | 0.036 | 0.232 | 0.729 |
| 0.154999999999926 | 0.037 | 0.24 | 0.755 |
| 0.157499999999926 | 0.038 | 0.249 | 0.781 |
| 0.159999999999926 | 0.04 | 0.258 | 0.808 |
| 0.162499999999926 | 0.041 | 0.267 | 0.835 |
| 0.164999999999926 | 0.043 | 0.276 | 0.863 |
| 0.167499999999926 | 0.045 | 0.286 | 0.892 |
| 0.169999999999926 | 0.046 | 0.295 | 0.921 |
| 0.172499999999926 | 0.048 | 0.305 | 0.95 |
| 0.174999999999926 | 0.05 | 0.315 | 0.98 |
| 0.177499999999926 | 0.051 | 0.325 | 1.011 |
| 0.179999999999926 | 0.053 | 0.336 | 1.042 |
| 0.182499999999926 | 0.055 | 0.346 | 1.074 |
| 0.184999999999926 | 0.057 | 0.357 | 1.106 |
| 0.187499999999926 | 0.059 | 0.368 | 1.139 |
| 0.189999999999926 | 0.061 | 0.379 | 1.172 |
| 0.192499999999926 | 0.063 | 0.391 | 1.206 |
| 0.194999999999926 | 0.065 | 0.402 | 1.24 |
| 0.197499999999926 | 0.067 | 0.414 | 1.275 |
| 0.199999999999926 | 0.069 | 0.426 | 1.311 |
| 0.202499999999926 | 0.071 | 0.438 | 1.347 |
| 0.204999999999926 | 0.074 | 0.451 | 1.384 |
| 0.207499999999926 | 0.076 | 0.463 | 1.421 |
| 0.209999999999926 | 0.078 | 0.476 | 1.459 |
| 0.212499999999926 | 0.08 | 0.489 | 1.497 |
| 0.214999999999926 | 0.083 | 0.502 | 1.536 |
| 0.217499999999926 | 0.085 | 0.516 | 1.576 |
| 0.219999999999926 | 0.088 | 0.53 | 1.616 |
| 0.222499999999926 | 0.09 | 0.543 | 1.657 |
| 0.224999999999926 | 0.093 | 0.558 | 1.698 |
| 0.227499999999926 | 0.096 | 0.572 | 1.74 |
| 0.229999999999926 | 0.098 | 0.587 | 1.783 |
| 0.232499999999926 | 0.101 | 0.601 | 1.826 |
| 0.234999999999926 | 0.104 | 0.617 | 1.87 |
| 0.237499999999926 | 0.107 | 0.632 | 1.914 |
| 0.239999999999926 | 0.11 | 0.647 | 1.959 |
| 0.242499999999926 | 0.113 | 0.663 | 2.005 |
| 0.244999999999926 | 0.116 | 0.679 | 2.051 |
| 0.247499999999926 | 0.119 | 0.695 | 2.098 |
| 0.249999999999926 | 0.122 | 0.712 | 2.146 |
| 0.252499999999926 | 0.125 | 0.729 | 2.194 |
| 0.254999999999926 | 0.129 | 0.746 | 2.243 |
| 0.257499999999926 | 0.132 | 0.763 | 2.292 |
| 0.259999999999926 | 0.135 | 0.78 | 2.342 |
| 0.262499999999926 | 0.139 | 0.798 | 2.393 |
| 0.264999999999926 | 0.142 | 0.816 | 2.444 |
| 0.267499999999926 | 0.146 | 0.834 | 2.496 |
| 0.269999999999926 | 0.149 | 0.853 | 2.549 |
| 0.272499999999926 | 0.153 | 0.871 | 2.602 |
| 0.274999999999926 | 0.157 | 0.89 | 2.656 |
| 0.277499999999926 | 0.161 | 0.91 | 2.711 |
| 0.279999999999926 | 0.164 | 0.929 | 2.767 |
| 0.282499999999926 | 0.168 | 0.949 | 2.823 |
| 0.284999999999926 | 0.172 | 0.969 | 2.879 |
| 0.287499999999926 | 0.176 | 0.989 | 2.937 |
| 0.289999999999926 | 0.181 | 1.01 | 2.995 |
| 0.292499999999926 | 0.185 | 1.031 | 3.054 |
| 0.294999999999926 | 0.189 | 1.052 | 3.113 |
| 0.297499999999926 | 0.193 | 1.073 | 3.173 |
| 0.299999999999926 | 0.198 | 1.095 | 3.234 |
| 0.302499999999926 | 0.202 | 1.117 | 3.296 |
| 0.304999999999926 | 0.207 | 1.139 | 3.358 |
| 0.307499999999926 | 0.211 | 1.162 | 3.421 |
| 0.309999999999926 | 0.216 | 1.185 | 3.485 |
| 0.312499999999926 | 0.221 | 1.208 | 3.55 |
| 0.314999999999926 | 0.226 | 1.231 | 3.615 |
| 0.317499999999926 | 0.231 | 1.255 | 3.681 |
| 0.319999999999926 | 0.236 | 1.279 | 3.747 |
| 0.322499999999926 | 0.241 | 1.303 | 3.815 |
| 0.324999999999926 | 0.246 | 1.328 | 3.883 |
| 0.327499999999926 | 0.251 | 1.352 | 3.952 |
| 0.329999999999926 | 0.256 | 1.378 | 4.021 |
| 0.332499999999926 | 0.262 | 1.403 | 4.092 |
| 0.334999999999926 | 0.267 | 1.429 | 4.163 |
| 0.337499999999926 | 0.273 | 1.455 | 4.235 |
| 0.339999999999926 | 0.278 | 1.481 | 4.307 |
| 0.342499999999926 | 0.284 | 1.508 | 4.381 |
| 0.344999999999926 | 0.29 | 1.535 | 4.455 |
| 0.347499999999926 | 0.295 | 1.562 | 4.53 |
| 0.349999999999926 | 0.301 | 1.59 | 4.605 |
| 0.352499999999926 | 0.307 | 1.618 | 4.682 |
| 0.354999999999926 | 0.314 | 1.646 | 4.759 |
| 0.357499999999926 | 0.32 | 1.675 | 4.837 |
| 0.359999999999926 | 0.326 | 1.703 | 4.916 |
| 0.362499999999926 | 0.332 | 1.733 | 4.996 |
| 0.364999999999926 | 0.339 | 1.762 | 5.076 |
| 0.367499999999926 | 0.345 | 1.792 | 5.157 |
| 0.369999999999926 | 0.352 | 1.822 | 5.24 |
| 0.372499999999926 | 0.359 | 1.853 | 5.322 |
| 0.374999999999926 | 0.366 | 1.884 | 5.406 |
| 0.377499999999926 | 0.372 | 1.915 | 5.491 |
| 0.379999999999926 | 0.379 | 1.947 | 5.576 |
| 0.382499999999926 | 0.387 | 1.979 | 5.662 |
| 0.384999999999926 | 0.394 | 2.011 | 5.749 |
| 0.387499999999926 | 0.401 | 2.043 | 5.837 |
| 0.389999999999926 | 0.408 | 2.076 | 5.926 |
| 0.392499999999926 | 0.416 | 2.11 | 6.015 |
| 0.394999999999926 | 0.424 | 2.143 | 6.105 |
| 0.397499999999926 | 0.431 | 2.177 | 6.197 |
| 0.399999999999926 | 0.439 | 2.212 | 6.289 |
| 0.402499999999926 | 0.447 | 2.247 | 6.382 |
| 0.404999999999926 | 0.455 | 2.282 | 6.475 |
| 0.407499999999926 | 0.463 | 2.317 | 6.57 |
| 0.409999999999926 | 0.471 | 2.353 | 6.665 |
| 0.412499999999926 | 0.48 | 2.389 | 6.762 |
| 0.414999999999926 | 0.488 | 2.426 | 6.859 |
| 0.417499999999926 | 0.496 | 2.463 | 6.957 |
| 0.419999999999926 | 0.505 | 2.5 | 7.056 |
| 0.422499999999926 | 0.514 | 2.538 | 7.156 |
| 0.424999999999926 | 0.523 | 2.576 | 7.257 |
| 0.427499999999926 | 0.532 | 2.614 | 7.359 |
| 0.429999999999926 | 0.541 | 2.653 | 7.461 |
| 0.432499999999926 | 0.55 | 2.692 | 7.565 |
| 0.434999999999926 | 0.559 | 2.732 | 7.669 |
| 0.437499999999926 | 0.569 | 2.772 | 7.775 |
| 0.439999999999926 | 0.578 | 2.812 | 7.881 |
| 0.442499999999926 | 0.588 | 2.853 | 7.988 |
| 0.444999999999926 | 0.597 | 2.894 | 8.096 |
| 0.447499999999926 | 0.607 | 2.936 | 8.205 |
| 0.449999999999926 | 0.617 | 2.978 | 8.315 |
| 0.452499999999926 | 0.627 | 3.02 | 8.426 |
| 0.454999999999926 | 0.638 | 3.063 | 8.538 |
| 0.457499999999926 | 0.648 | 3.106 | 8.651 |
| 0.459999999999926 | 0.659 | 3.15 | 8.765 |
| 0.462499999999926 | 0.669 | 3.194 | 8.88 |
| 0.464999999999926 | 0.68 | 3.239 | 8.995 |
| 0.467499999999926 | 0.691 | 3.283 | 9.112 |
| 0.469999999999926 | 0.702 | 3.329 | 9.23 |
| 0.472499999999926 | 0.713 | 3.375 | 9.348 |
| 0.474999999999926 | 0.724 | 3.421 | 9.468 |
| 0.477499999999926 | 0.735 | 3.467 | 9.588 |
| 0.479999999999926 | 0.747 | 3.514 | 9.71 |
| 0.482499999999926 | 0.759 | 3.562 | 9.833 |
| 0.484999999999926 | 0.77 | 3.61 | 9.956 |
| 0.487499999999926 | 0.782 | 3.658 | 10.081 |
| 0.489999999999926 | 0.794 | 3.707 | 10.206 |
| 0.492499999999926 | 0.806 | 3.756 | 10.333 |
| 0.494999999999926 | 0.819 | 3.806 | 10.46 |
| 0.497499999999926 | 0.831 | 3.856 | 10.589 |
| 0.499999999999926 | 0.844 | 3.906 | 10.719 |
| 0.502499999999926 | 0.856 | 3.957 | 10.849 |
| 0.504999999999926 | 0.869 | 4.009 | 10.981 |
| 0.507499999999926 | 0.882 | 4.061 | 11.114 |
| 0.509999999999926 | 0.896 | 4.113 | 11.248 |
| 0.512499999999926 | 0.909 | 4.166 | 11.382 |
| 0.514999999999926 | 0.922 | 4.219 | 11.518 |
| 0.517499999999926 | 0.936 | 4.273 | 11.655 |
| 0.519999999999926 | 0.95 | 4.327 | 11.793 |
| 0.522499999999926 | 0.963 | 4.382 | 11.932 |
| 0.524999999999926 | 0.978 | 4.437 | 12.072 |
| 0.527499999999926 | 0.992 | 4.493 | 12.214 |
| 0.529999999999926 | 1.006 | 4.549 | 12.356 |
| 0.532499999999925 | 1.021 | 4.606 | 12.499 |
| 0.534999999999925 | 1.035 | 4.663 | 12.644 |
| 0.537499999999925 | 1.05 | 4.72 | 12.789 |
| 0.539999999999925 | 1.065 | 4.778 | 12.936 |
| 0.542499999999925 | 1.08 | 4.837 | 13.084 |
| 0.544999999999925 | 1.095 | 4.896 | 13.232 |
| 0.547499999999925 | 1.111 | 4.956 | 13.382 |
| 0.549999999999925 | 1.126 | 5.016 | 13.534 |
| 0.552499999999925 | 1.142 | 5.076 | 13.686 |
| 0.554999999999925 | 1.158 | 5.138 | 13.839 |
| 0.557499999999925 | 1.174 | 5.199 | 13.993 |
| 0.559999999999925 | 1.191 | 5.261 | 14.149 |
| 0.562499999999925 | 1.207 | 5.324 | 14.306 |
| 0.564999999999925 | 1.224 | 5.387 | 14.464 |
| 0.567499999999925 | 1.24 | 5.451 | 14.623 |
| 0.569999999999925 | 1.257 | 5.515 | 14.783 |
| 0.572499999999925 | 1.274 | 5.58 | 14.944 |
| 0.574999999999925 | 1.292 | 5.645 | 15.106 |
| 0.577499999999925 | 1.309 | 5.711 | 15.27 |
| 0.579999999999924 | 1.327 | 5.777 | 15.435 |
| 0.582499999999924 | 1.345 | 5.844 | 15.601 |
| 0.584999999999924 | 1.363 | 5.911 | 15.768 |
| 0.587499999999924 | 1.381 | 5.979 | 15.936 |
| 0.589999999999924 | 1.399 | 6.048 | 16.106 |
| 0.592499999999924 | 1.418 | 6.117 | 16.277 |
| 0.594999999999924 | 1.437 | 6.187 | 16.449 |
| 0.597499999999924 | 1.455 | 6.257 | 16.622 |
| 0.599999999999924 | 1.475 | 6.327 | 16.796 |
| 0.602499999999924 | 1.494 | 6.399 | 16.972 |
| 0.604999999999924 | 1.513 | 6.47 | 17.149 |
| 0.607499999999924 | 1.533 | 6.543 | 17.327 |
| 0.609999999999924 | 1.553 | 6.616 | 17.506 |
| 0.612499999999924 | 1.573 | 6.689 | 17.686 |
| 0.614999999999924 | 1.593 | 6.763 | 17.868 |
| 0.617499999999924 | 1.614 | 6.838 | 18.051 |
| 0.619999999999924 | 1.634 | 6.913 | 18.235 |
| 0.622499999999923 | 1.655 | 6.989 | 18.421 |
| 0.624999999999923 | 1.676 | 7.066 | 18.607 |
| 0.627499999999923 | 1.697 | 7.143 | 18.795 |
| 0.629999999999923 | 1.719 | 7.22 | 18.985 |
| 0.632499999999923 | 1.741 | 7.298 | 19.175 |
| 0.634999999999923 | 1.762 | 7.377 | 19.367 |
| 0.637499999999923 | 1.784 | 7.457 | 19.56 |
| 0.639999999999923 | 1.807 | 7.537 | 19.754 |
| 0.642499999999923 | 1.829 | 7.617 | 19.95 |
| 0.644999999999923 | 1.852 | 7.698 | 20.147 |
| 0.647499999999923 | 1.875 | 7.78 | 20.345 |
| 0.649999999999923 | 1.898 | 7.863 | 20.545 |
| 0.652499999999923 | 1.921 | 7.946 | 20.746 |
| 0.654999999999923 | 1.945 | 8.029 | 20.948 |
| 0.657499999999923 | 1.969 | 8.114 | 21.152 |
| 0.659999999999923 | 1.993 | 8.198 | 21.357 |
| 0.662499999999923 | 2.017 | 8.284 | 21.563 |
| 0.664999999999923 | 2.041 | 8.37 | 21.77 |
| 0.667499999999922 | 2.066 | 8.457 | 21.979 |
| 0.669999999999922 | 2.091 | 8.544 | 22.19 |
| 0.672499999999922 | 2.116 | 8.633 | 22.401 |
| 0.674999999999922 | 2.141 | 8.721 | 22.614 |
| 0.677499999999922 | 2.167 | 8.811 | 22.828 |
| 0.679999999999922 | 2.193 | 8.901 | 23.044 |
| 0.682499999999922 | 2.219 | 8.991 | 23.261 |
| 0.684999999999922 | 2.245 | 9.083 | 23.48 |
| 0.687499999999922 | 2.271 | 9.175 | 23.7 |
| 0.689999999999922 | 2.298 | 9.267 | 23.921 |
| 0.692499999999922 | 2.325 | 9.361 | 24.144 |
| 0.694999999999922 | 2.352 | 9.455 | 24.368 |
| 0.697499999999922 | 2.38 | 9.549 | 24.593 |
| 0.699999999999922 | 2.407 | 9.645 | 24.82 |
| 0.702499999999922 | 2.435 | 9.741 | 25.048 |
| 0.704999999999922 | 2.463 | 9.837 | 25.278 |
| 0.707499999999922 | 2.492 | 9.935 | 25.509 |
| 0.709999999999922 | 2.521 | 10.033 | 25.742 |
| 0.712499999999922 | 2.55 | 10.132 | 25.976 |
| 0.714999999999922 | 2.579 | 10.231 | 26.211 |
| 0.717499999999921 | 2.608 | 10.331 | 26.448 |
| 0.719999999999921 | 2.638 | 10.432 | 26.687 |
| 0.722499999999921 | 2.668 | 10.534 | 26.926 |
| 0.724999999999921 | 2.698 | 10.636 | 27.168 |
| 0.727499999999921 | 2.728 | 10.739 | 27.411 |
| 0.729999999999921 | 2.759 | 10.843 | 27.655 |
| 0.732499999999921 | 2.79 | 10.947 | 27.901 |
| 0.734999999999921 | 2.821 | 11.052 | 28.148 |
| 0.737499999999921 | 2.853 | 11.158 | 28.397 |
| 0.739999999999921 | 2.885 | 11.265 | 28.647 |
| 0.742499999999921 | 2.917 | 11.372 | 28.899 |
| 0.744999999999921 | 2.949 | 11.48 | 29.152 |
| 0.747499999999921 | 2.982 | 11.589 | 29.407 |
| 0.749999999999921 | 3.015 | 11.698 | 29.663 |
| 0.752499999999921 | 3.048 | 11.809 | 29.921 |
| 0.754999999999921 | 3.081 | 11.92 | 30.18 |
| 0.757499999999921 | 3.115 | 12.031 | 30.441 |
| 0.759999999999921 | 3.149 | 12.144 | 30.704 |
| 0.76249999999992 | 3.183 | 12.257 | 30.968 |
| 0.76499999999992 | 3.218 | 12.371 | 31.233 |
| 0.76749999999992 | 3.253 | 12.486 | 31.5 |
| 0.76999999999992 | 3.288 | 12.601 | 31.769 |
| 0.77249999999992 | 3.323 | 12.718 | 32.039 |
| 0.77499999999992 | 3.359 | 12.835 | 32.311 |
| 0.77749999999992 | 3.395 | 12.953 | 32.585 |
| 0.77999999999992 | 3.431 | 13.071 | 32.86 |
| 0.78249999999992 | 3.468 | 13.191 | 33.136 |
| 0.78499999999992 | 3.505 | 13.311 | 33.415 |
| 0.78749999999992 | 3.542 | 13.432 | 33.695 |
| 0.78999999999992 | 3.579 | 13.554 | 33.976 |
| 0.79249999999992 | 3.617 | 13.677 | 34.259 |
| 0.79499999999992 | 3.655 | 13.8 | 34.544 |
| 0.79749999999992 | 3.694 | 13.924 | 34.83 |
| 0.79999999999992 | 3.732 | 14.049 | 35.118 |
| 0.80249999999992 | 3.772 | 14.175 | 35.408 |
| 0.80499999999992 | 3.811 | 14.302 | 35.699 |
| 0.80749999999992 | 3.851 | 14.429 | 35.992 |
| 0.80999999999992 | 3.891 | 14.558 | 36.286 |
| 0.812499999999919 | 3.931 | 14.687 | 36.583 |
| 0.814999999999919 | 3.971 | 14.817 | 36.881 |
| 0.817499999999919 | 4.012 | 14.947 | 37.18 |
| 0.819999999999919 | 4.054 | 15.079 | 37.482 |
| 0.822499999999919 | 4.095 | 15.212 | 37.785 |
| 0.824999999999919 | 4.137 | 15.345 | 38.089 |
| 0.827499999999919 | 4.179 | 15.479 | 38.396 |
| 0.829999999999919 | 4.222 | 15.614 | 38.704 |
| 0.832499999999919 | 4.265 | 15.75 | 39.014 |
| 0.834999999999919 | 4.308 | 15.887 | 39.325 |
| 0.837499999999919 | 4.352 | 16.024 | 39.638 |
| 0.839999999999919 | 4.396 | 16.163 | 39.953 |
| 0.842499999999919 | 4.44 | 16.302 | 40.27 |
| 0.844999999999919 | 4.484 | 16.442 | 40.588 |
| 0.847499999999919 | 4.529 | 16.583 | 40.909 |
| 0.849999999999919 | 4.575 | 16.725 | 41.231 |
| 0.852499999999919 | 4.62 | 16.868 | 41.554 |
| 0.854999999999919 | 4.666 | 17.012 | 41.88 |
| 0.857499999999918 | 4.713 | 17.156 | 42.207 |
| 0.859999999999918 | 4.759 | 17.302 | 42.536 |
| 0.862499999999918 | 4.806 | 17.448 | 42.867 |
| 0.864999999999918 | 4.854 | 17.596 | 43.2 |
| 0.867499999999918 | 4.901 | 17.744 | 43.534 |
| 0.869999999999918 | 4.95 | 17.893 | 43.87 |
| 0.872499999999918 | 4.998 | 18.043 | 44.208 |
| 0.874999999999918 | 5.047 | 18.194 | 44.548 |
| 0.877499999999918 | 5.096 | 18.346 | 44.89 |
| 0.879999999999918 | 5.146 | 18.499 | 45.234 |
| 0.882499999999918 | 5.196 | 18.653 | 45.579 |
| 0.884999999999918 | 5.246 | 18.807 | 45.926 |
| 0.887499999999918 | 5.297 | 18.963 | 46.275 |
| 0.889999999999918 | 5.348 | 19.119 | 46.626 |
| 0.892499999999918 | 5.399 | 19.277 | 46.979 |
| 0.894999999999918 | 5.451 | 19.435 | 47.333 |
| 0.897499999999918 | 5.503 | 19.595 | 47.69 |
| 0.899999999999918 | 5.556 | 19.755 | 48.048 |
| 0.902499999999918 | 5.609 | 19.916 | 48.409 |
| 0.904999999999918 | 5.662 | 20.079 | 48.771 |
| 0.907499999999917 | 5.716 | 20.242 | 49.135 |
| 0.909999999999917 | 5.77 | 20.406 | 49.501 |
| 0.912499999999917 | 5.825 | 20.571 | 49.869 |
| 0.914999999999917 | 5.88 | 20.738 | 50.239 |
| 0.917499999999917 | 5.935 | 20.905 | 50.61 |
| 0.919999999999917 | 5.991 | 21.073 | 50.984 |
| 0.922499999999917 | 6.047 | 21.242 | 51.36 |
| 0.924999999999917 | 6.103 | 21.412 | 51.737 |
| 0.927499999999917 | 6.16 | 21.583 | 52.117 |
| 0.929999999999917 | 6.218 | 21.755 | 52.498 |
| 0.932499999999917 | 6.276 | 21.929 | 52.882 |
| 0.934999999999917 | 6.334 | 22.103 | 53.267 |
| 0.937499999999917 | 6.392 | 22.278 | 53.654 |
| 0.939999999999917 | 6.452 | 22.454 | 54.044 |
| 0.942499999999917 | 6.511 | 22.631 | 54.435 |
| 0.944999999999917 | 6.571 | 22.81 | 54.828 |
| 0.947499999999917 | 6.631 | 22.989 | 55.224 |
| 0.949999999999917 | 6.692 | 23.169 | 55.621 |
| 0.952499999999916 | 6.753 | 23.351 | 56.02 |
| 0.954999999999916 | 6.815 | 23.533 | 56.422 |
| 0.957499999999916 | 6.877 | 23.717 | 56.825 |
| 0.959999999999916 | 6.939 | 23.901 | 57.231 |
| 0.962499999999916 | 7.002 | 24.087 | 57.638 |
| 0.964999999999916 | 7.065 | 24.273 | 58.048 |
| 0.967499999999916 | 7.129 | 24.461 | 58.459 |
| 0.969999999999916 | 7.194 | 24.65 | 58.873 |
| 0.972499999999916 | 7.258 | 24.84 | 59.289 |
| 0.974999999999916 | 7.323 | 25.031 | 59.706 |
| 0.977499999999916 | 7.389 | 25.223 | 60.126 |
| 0.979999999999916 | 7.455 | 25.416 | 60.548 |
| 0.982499999999916 | 7.522 | 25.61 | 60.972 |
| 0.984999999999916 | 7.588 | 25.805 | 61.398 |
| 0.987499999999916 | 7.656 | 26.001 | 61.827 |
| 0.989999999999916 | 7.724 | 26.199 | 62.257 |
| 0.992499999999916 | 7.792 | 26.398 | 62.69 |
| 0.994999999999916 | 7.861 | 26.597 | 63.124 |
| 0.997499999999916 | 7.93 | 26.798 | 63.561 |
| 0.999999999999915 | 8 | 27 | 64 |